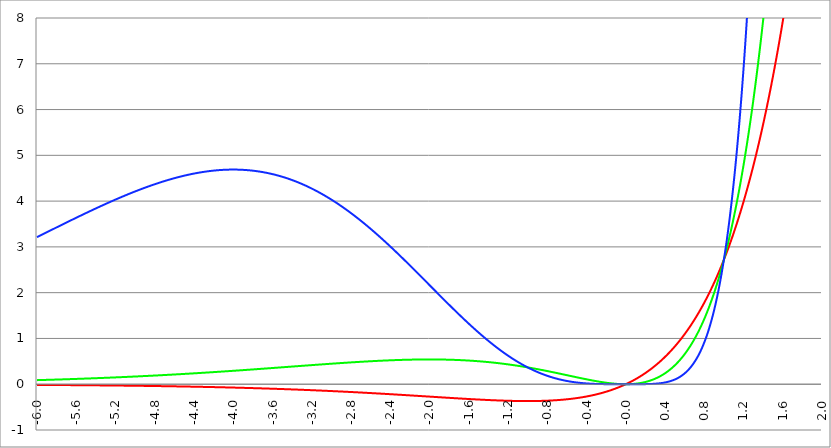
| Category | Series 1 | Series 0 | Series 2 |
|---|---|---|---|
| -6.0 | -0.015 | 0.089 | 3.212 |
| -5.996 | -0.015 | 0.089 | 3.217 |
| -5.992000000000001 | -0.015 | 0.09 | 3.221 |
| -5.988000000000001 | -0.015 | 0.09 | 3.225 |
| -5.984000000000002 | -0.015 | 0.09 | 3.23 |
| -5.980000000000002 | -0.015 | 0.09 | 3.234 |
| -5.976000000000002 | -0.015 | 0.091 | 3.238 |
| -5.972000000000003 | -0.015 | 0.091 | 3.242 |
| -5.968000000000003 | -0.015 | 0.091 | 3.247 |
| -5.964000000000004 | -0.015 | 0.091 | 3.251 |
| -5.960000000000004 | -0.015 | 0.092 | 3.255 |
| -5.956000000000004 | -0.015 | 0.092 | 3.26 |
| -5.952000000000005 | -0.015 | 0.092 | 3.264 |
| -5.948000000000005 | -0.016 | 0.092 | 3.268 |
| -5.944000000000006 | -0.016 | 0.093 | 3.272 |
| -5.940000000000006 | -0.016 | 0.093 | 3.277 |
| -5.936000000000007 | -0.016 | 0.093 | 3.281 |
| -5.932000000000007 | -0.016 | 0.093 | 3.285 |
| -5.928000000000008 | -0.016 | 0.094 | 3.29 |
| -5.924000000000008 | -0.016 | 0.094 | 3.294 |
| -5.920000000000009 | -0.016 | 0.094 | 3.298 |
| -5.91600000000001 | -0.016 | 0.094 | 3.302 |
| -5.91200000000001 | -0.016 | 0.095 | 3.307 |
| -5.90800000000001 | -0.016 | 0.095 | 3.311 |
| -5.904000000000011 | -0.016 | 0.095 | 3.315 |
| -5.900000000000011 | -0.016 | 0.095 | 3.319 |
| -5.896000000000011 | -0.016 | 0.096 | 3.324 |
| -5.892000000000012 | -0.016 | 0.096 | 3.328 |
| -5.888000000000012 | -0.016 | 0.096 | 3.332 |
| -5.884000000000013 | -0.016 | 0.096 | 3.337 |
| -5.880000000000013 | -0.016 | 0.097 | 3.341 |
| -5.876000000000014 | -0.016 | 0.097 | 3.345 |
| -5.872000000000014 | -0.017 | 0.097 | 3.349 |
| -5.868000000000014 | -0.017 | 0.097 | 3.354 |
| -5.864000000000015 | -0.017 | 0.098 | 3.358 |
| -5.860000000000015 | -0.017 | 0.098 | 3.362 |
| -5.856000000000016 | -0.017 | 0.098 | 3.366 |
| -5.852000000000016 | -0.017 | 0.098 | 3.371 |
| -5.848000000000017 | -0.017 | 0.099 | 3.375 |
| -5.844000000000017 | -0.017 | 0.099 | 3.379 |
| -5.840000000000018 | -0.017 | 0.099 | 3.384 |
| -5.836000000000018 | -0.017 | 0.099 | 3.388 |
| -5.832000000000018 | -0.017 | 0.1 | 3.392 |
| -5.828000000000019 | -0.017 | 0.1 | 3.396 |
| -5.824000000000019 | -0.017 | 0.1 | 3.401 |
| -5.82000000000002 | -0.017 | 0.101 | 3.405 |
| -5.81600000000002 | -0.017 | 0.101 | 3.409 |
| -5.812000000000021 | -0.017 | 0.101 | 3.413 |
| -5.808000000000021 | -0.017 | 0.101 | 3.418 |
| -5.804000000000022 | -0.018 | 0.102 | 3.422 |
| -5.800000000000022 | -0.018 | 0.102 | 3.426 |
| -5.796000000000022 | -0.018 | 0.102 | 3.43 |
| -5.792000000000023 | -0.018 | 0.102 | 3.435 |
| -5.788000000000023 | -0.018 | 0.103 | 3.439 |
| -5.784000000000024 | -0.018 | 0.103 | 3.443 |
| -5.780000000000024 | -0.018 | 0.103 | 3.447 |
| -5.776000000000024 | -0.018 | 0.103 | 3.452 |
| -5.772000000000025 | -0.018 | 0.104 | 3.456 |
| -5.768000000000025 | -0.018 | 0.104 | 3.46 |
| -5.764000000000026 | -0.018 | 0.104 | 3.464 |
| -5.760000000000026 | -0.018 | 0.105 | 3.469 |
| -5.756000000000026 | -0.018 | 0.105 | 3.473 |
| -5.752000000000027 | -0.018 | 0.105 | 3.477 |
| -5.748000000000027 | -0.018 | 0.105 | 3.481 |
| -5.744000000000028 | -0.018 | 0.106 | 3.486 |
| -5.740000000000028 | -0.018 | 0.106 | 3.49 |
| -5.73600000000003 | -0.019 | 0.106 | 3.494 |
| -5.73200000000003 | -0.019 | 0.106 | 3.498 |
| -5.72800000000003 | -0.019 | 0.107 | 3.502 |
| -5.72400000000003 | -0.019 | 0.107 | 3.507 |
| -5.720000000000031 | -0.019 | 0.107 | 3.511 |
| -5.716000000000031 | -0.019 | 0.108 | 3.515 |
| -5.712000000000032 | -0.019 | 0.108 | 3.519 |
| -5.708000000000032 | -0.019 | 0.108 | 3.524 |
| -5.704000000000033 | -0.019 | 0.108 | 3.528 |
| -5.700000000000033 | -0.019 | 0.109 | 3.532 |
| -5.696000000000033 | -0.019 | 0.109 | 3.536 |
| -5.692000000000034 | -0.019 | 0.109 | 3.54 |
| -5.688000000000034 | -0.019 | 0.11 | 3.545 |
| -5.684000000000035 | -0.019 | 0.11 | 3.549 |
| -5.680000000000035 | -0.019 | 0.11 | 3.553 |
| -5.676000000000035 | -0.019 | 0.11 | 3.557 |
| -5.672000000000036 | -0.02 | 0.111 | 3.561 |
| -5.668000000000036 | -0.02 | 0.111 | 3.566 |
| -5.664000000000037 | -0.02 | 0.111 | 3.57 |
| -5.660000000000037 | -0.02 | 0.112 | 3.574 |
| -5.656000000000038 | -0.02 | 0.112 | 3.578 |
| -5.652000000000038 | -0.02 | 0.112 | 3.582 |
| -5.648000000000039 | -0.02 | 0.112 | 3.587 |
| -5.644000000000039 | -0.02 | 0.113 | 3.591 |
| -5.64000000000004 | -0.02 | 0.113 | 3.595 |
| -5.63600000000004 | -0.02 | 0.113 | 3.599 |
| -5.63200000000004 | -0.02 | 0.114 | 3.603 |
| -5.628000000000041 | -0.02 | 0.114 | 3.608 |
| -5.624000000000041 | -0.02 | 0.114 | 3.612 |
| -5.620000000000042 | -0.02 | 0.114 | 3.616 |
| -5.616000000000042 | -0.02 | 0.115 | 3.62 |
| -5.612000000000043 | -0.021 | 0.115 | 3.624 |
| -5.608000000000043 | -0.021 | 0.115 | 3.628 |
| -5.604000000000044 | -0.021 | 0.116 | 3.633 |
| -5.600000000000044 | -0.021 | 0.116 | 3.637 |
| -5.596000000000044 | -0.021 | 0.116 | 3.641 |
| -5.592000000000045 | -0.021 | 0.117 | 3.645 |
| -5.588000000000045 | -0.021 | 0.117 | 3.649 |
| -5.584000000000046 | -0.021 | 0.117 | 3.653 |
| -5.580000000000046 | -0.021 | 0.117 | 3.657 |
| -5.576000000000046 | -0.021 | 0.118 | 3.662 |
| -5.572000000000047 | -0.021 | 0.118 | 3.666 |
| -5.568000000000048 | -0.021 | 0.118 | 3.67 |
| -5.564000000000048 | -0.021 | 0.119 | 3.674 |
| -5.560000000000048 | -0.021 | 0.119 | 3.678 |
| -5.556000000000049 | -0.021 | 0.119 | 3.682 |
| -5.552000000000049 | -0.022 | 0.12 | 3.686 |
| -5.54800000000005 | -0.022 | 0.12 | 3.69 |
| -5.54400000000005 | -0.022 | 0.12 | 3.695 |
| -5.540000000000051 | -0.022 | 0.121 | 3.699 |
| -5.536000000000051 | -0.022 | 0.121 | 3.703 |
| -5.532000000000052 | -0.022 | 0.121 | 3.707 |
| -5.528000000000052 | -0.022 | 0.121 | 3.711 |
| -5.524000000000052 | -0.022 | 0.122 | 3.715 |
| -5.520000000000053 | -0.022 | 0.122 | 3.719 |
| -5.516000000000053 | -0.022 | 0.122 | 3.723 |
| -5.512000000000054 | -0.022 | 0.123 | 3.727 |
| -5.508000000000054 | -0.022 | 0.123 | 3.731 |
| -5.504000000000055 | -0.022 | 0.123 | 3.736 |
| -5.500000000000055 | -0.022 | 0.124 | 3.74 |
| -5.496000000000055 | -0.023 | 0.124 | 3.744 |
| -5.492000000000056 | -0.023 | 0.124 | 3.748 |
| -5.488000000000056 | -0.023 | 0.125 | 3.752 |
| -5.484000000000057 | -0.023 | 0.125 | 3.756 |
| -5.480000000000057 | -0.023 | 0.125 | 3.76 |
| -5.476000000000057 | -0.023 | 0.126 | 3.764 |
| -5.472000000000058 | -0.023 | 0.126 | 3.768 |
| -5.468000000000059 | -0.023 | 0.126 | 3.772 |
| -5.464000000000059 | -0.023 | 0.126 | 3.776 |
| -5.460000000000059 | -0.023 | 0.127 | 3.78 |
| -5.45600000000006 | -0.023 | 0.127 | 3.784 |
| -5.45200000000006 | -0.023 | 0.127 | 3.788 |
| -5.44800000000006 | -0.023 | 0.128 | 3.792 |
| -5.444000000000061 | -0.024 | 0.128 | 3.796 |
| -5.440000000000061 | -0.024 | 0.128 | 3.8 |
| -5.436000000000062 | -0.024 | 0.129 | 3.804 |
| -5.432000000000062 | -0.024 | 0.129 | 3.808 |
| -5.428000000000063 | -0.024 | 0.129 | 3.812 |
| -5.424000000000063 | -0.024 | 0.13 | 3.817 |
| -5.420000000000064 | -0.024 | 0.13 | 3.821 |
| -5.416000000000064 | -0.024 | 0.13 | 3.825 |
| -5.412000000000064 | -0.024 | 0.131 | 3.829 |
| -5.408000000000065 | -0.024 | 0.131 | 3.833 |
| -5.404000000000065 | -0.024 | 0.131 | 3.836 |
| -5.400000000000066 | -0.024 | 0.132 | 3.84 |
| -5.396000000000066 | -0.024 | 0.132 | 3.844 |
| -5.392000000000067 | -0.025 | 0.132 | 3.848 |
| -5.388000000000067 | -0.025 | 0.133 | 3.852 |
| -5.384000000000068 | -0.025 | 0.133 | 3.856 |
| -5.380000000000068 | -0.025 | 0.133 | 3.86 |
| -5.376000000000068 | -0.025 | 0.134 | 3.864 |
| -5.37200000000007 | -0.025 | 0.134 | 3.868 |
| -5.36800000000007 | -0.025 | 0.134 | 3.872 |
| -5.36400000000007 | -0.025 | 0.135 | 3.876 |
| -5.36000000000007 | -0.025 | 0.135 | 3.88 |
| -5.356000000000071 | -0.025 | 0.135 | 3.884 |
| -5.352000000000071 | -0.025 | 0.136 | 3.888 |
| -5.348000000000072 | -0.025 | 0.136 | 3.892 |
| -5.344000000000072 | -0.026 | 0.136 | 3.896 |
| -5.340000000000073 | -0.026 | 0.137 | 3.9 |
| -5.336000000000073 | -0.026 | 0.137 | 3.904 |
| -5.332000000000074 | -0.026 | 0.137 | 3.908 |
| -5.328000000000074 | -0.026 | 0.138 | 3.911 |
| -5.324000000000074 | -0.026 | 0.138 | 3.915 |
| -5.320000000000075 | -0.026 | 0.138 | 3.919 |
| -5.316000000000075 | -0.026 | 0.139 | 3.923 |
| -5.312000000000076 | -0.026 | 0.139 | 3.927 |
| -5.308000000000076 | -0.026 | 0.14 | 3.931 |
| -5.304000000000077 | -0.026 | 0.14 | 3.935 |
| -5.300000000000077 | -0.026 | 0.14 | 3.939 |
| -5.296000000000077 | -0.027 | 0.141 | 3.942 |
| -5.292000000000078 | -0.027 | 0.141 | 3.946 |
| -5.288000000000078 | -0.027 | 0.141 | 3.95 |
| -5.284000000000079 | -0.027 | 0.142 | 3.954 |
| -5.28000000000008 | -0.027 | 0.142 | 3.958 |
| -5.27600000000008 | -0.027 | 0.142 | 3.962 |
| -5.27200000000008 | -0.027 | 0.143 | 3.966 |
| -5.268000000000081 | -0.027 | 0.143 | 3.969 |
| -5.264000000000081 | -0.027 | 0.143 | 3.973 |
| -5.260000000000081 | -0.027 | 0.144 | 3.977 |
| -5.256000000000082 | -0.027 | 0.144 | 3.981 |
| -5.252000000000082 | -0.028 | 0.144 | 3.985 |
| -5.248000000000083 | -0.028 | 0.145 | 3.988 |
| -5.244000000000083 | -0.028 | 0.145 | 3.992 |
| -5.240000000000084 | -0.028 | 0.146 | 3.996 |
| -5.236000000000084 | -0.028 | 0.146 | 4 |
| -5.232000000000084 | -0.028 | 0.146 | 4.004 |
| -5.228000000000085 | -0.028 | 0.147 | 4.007 |
| -5.224000000000085 | -0.028 | 0.147 | 4.011 |
| -5.220000000000086 | -0.028 | 0.147 | 4.015 |
| -5.216000000000086 | -0.028 | 0.148 | 4.019 |
| -5.212000000000087 | -0.028 | 0.148 | 4.022 |
| -5.208000000000087 | -0.029 | 0.148 | 4.026 |
| -5.204000000000088 | -0.029 | 0.149 | 4.03 |
| -5.200000000000088 | -0.029 | 0.149 | 4.034 |
| -5.196000000000089 | -0.029 | 0.15 | 4.037 |
| -5.192000000000089 | -0.029 | 0.15 | 4.041 |
| -5.188000000000089 | -0.029 | 0.15 | 4.045 |
| -5.18400000000009 | -0.029 | 0.151 | 4.048 |
| -5.18000000000009 | -0.029 | 0.151 | 4.052 |
| -5.176000000000091 | -0.029 | 0.151 | 4.056 |
| -5.172000000000091 | -0.029 | 0.152 | 4.059 |
| -5.168000000000092 | -0.029 | 0.152 | 4.063 |
| -5.164000000000092 | -0.03 | 0.153 | 4.067 |
| -5.160000000000092 | -0.03 | 0.153 | 4.07 |
| -5.156000000000093 | -0.03 | 0.153 | 4.074 |
| -5.152000000000093 | -0.03 | 0.154 | 4.078 |
| -5.148000000000094 | -0.03 | 0.154 | 4.081 |
| -5.144000000000094 | -0.03 | 0.154 | 4.085 |
| -5.140000000000095 | -0.03 | 0.155 | 4.089 |
| -5.136000000000095 | -0.03 | 0.155 | 4.092 |
| -5.132000000000096 | -0.03 | 0.156 | 4.096 |
| -5.128000000000096 | -0.03 | 0.156 | 4.099 |
| -5.124000000000096 | -0.03 | 0.156 | 4.103 |
| -5.120000000000097 | -0.031 | 0.157 | 4.107 |
| -5.116000000000097 | -0.031 | 0.157 | 4.11 |
| -5.112000000000098 | -0.031 | 0.157 | 4.114 |
| -5.108000000000098 | -0.031 | 0.158 | 4.117 |
| -5.104000000000099 | -0.031 | 0.158 | 4.121 |
| -5.100000000000099 | -0.031 | 0.159 | 4.125 |
| -5.0960000000001 | -0.031 | 0.159 | 4.128 |
| -5.0920000000001 | -0.031 | 0.159 | 4.132 |
| -5.0880000000001 | -0.031 | 0.16 | 4.135 |
| -5.084000000000101 | -0.031 | 0.16 | 4.139 |
| -5.080000000000101 | -0.032 | 0.161 | 4.142 |
| -5.076000000000101 | -0.032 | 0.161 | 4.146 |
| -5.072000000000102 | -0.032 | 0.161 | 4.149 |
| -5.068000000000103 | -0.032 | 0.162 | 4.153 |
| -5.064000000000103 | -0.032 | 0.162 | 4.156 |
| -5.060000000000104 | -0.032 | 0.162 | 4.16 |
| -5.056000000000104 | -0.032 | 0.163 | 4.163 |
| -5.052000000000104 | -0.032 | 0.163 | 4.167 |
| -5.048000000000104 | -0.032 | 0.164 | 4.17 |
| -5.044000000000105 | -0.033 | 0.164 | 4.174 |
| -5.040000000000105 | -0.033 | 0.164 | 4.177 |
| -5.036000000000106 | -0.033 | 0.165 | 4.181 |
| -5.032000000000106 | -0.033 | 0.165 | 4.184 |
| -5.028000000000107 | -0.033 | 0.166 | 4.187 |
| -5.024000000000107 | -0.033 | 0.166 | 4.191 |
| -5.020000000000108 | -0.033 | 0.166 | 4.194 |
| -5.016000000000108 | -0.033 | 0.167 | 4.198 |
| -5.012000000000109 | -0.033 | 0.167 | 4.201 |
| -5.00800000000011 | -0.033 | 0.168 | 4.204 |
| -5.00400000000011 | -0.034 | 0.168 | 4.208 |
| -5.00000000000011 | -0.034 | 0.168 | 4.211 |
| -4.99600000000011 | -0.034 | 0.169 | 4.215 |
| -4.992000000000111 | -0.034 | 0.169 | 4.218 |
| -4.988000000000111 | -0.034 | 0.17 | 4.221 |
| -4.984000000000112 | -0.034 | 0.17 | 4.225 |
| -4.980000000000112 | -0.034 | 0.17 | 4.228 |
| -4.976000000000112 | -0.034 | 0.171 | 4.231 |
| -4.972000000000113 | -0.034 | 0.171 | 4.235 |
| -4.968000000000114 | -0.035 | 0.172 | 4.238 |
| -4.964000000000114 | -0.035 | 0.172 | 4.241 |
| -4.960000000000114 | -0.035 | 0.173 | 4.244 |
| -4.956000000000114 | -0.035 | 0.173 | 4.248 |
| -4.952000000000115 | -0.035 | 0.173 | 4.251 |
| -4.948000000000115 | -0.035 | 0.174 | 4.254 |
| -4.944000000000116 | -0.035 | 0.174 | 4.258 |
| -4.940000000000116 | -0.035 | 0.175 | 4.261 |
| -4.936000000000117 | -0.035 | 0.175 | 4.264 |
| -4.932000000000117 | -0.036 | 0.175 | 4.267 |
| -4.928000000000118 | -0.036 | 0.176 | 4.271 |
| -4.924000000000118 | -0.036 | 0.176 | 4.274 |
| -4.920000000000119 | -0.036 | 0.177 | 4.277 |
| -4.91600000000012 | -0.036 | 0.177 | 4.28 |
| -4.91200000000012 | -0.036 | 0.178 | 4.283 |
| -4.90800000000012 | -0.036 | 0.178 | 4.286 |
| -4.90400000000012 | -0.036 | 0.178 | 4.29 |
| -4.90000000000012 | -0.036 | 0.179 | 4.293 |
| -4.896000000000121 | -0.037 | 0.179 | 4.296 |
| -4.892000000000122 | -0.037 | 0.18 | 4.299 |
| -4.888000000000122 | -0.037 | 0.18 | 4.302 |
| -4.884000000000123 | -0.037 | 0.18 | 4.305 |
| -4.880000000000123 | -0.037 | 0.181 | 4.308 |
| -4.876000000000123 | -0.037 | 0.181 | 4.312 |
| -4.872000000000124 | -0.037 | 0.182 | 4.315 |
| -4.868000000000124 | -0.037 | 0.182 | 4.318 |
| -4.864000000000125 | -0.038 | 0.183 | 4.321 |
| -4.860000000000125 | -0.038 | 0.183 | 4.324 |
| -4.856000000000125 | -0.038 | 0.183 | 4.327 |
| -4.852000000000126 | -0.038 | 0.184 | 4.33 |
| -4.848000000000126 | -0.038 | 0.184 | 4.333 |
| -4.844000000000127 | -0.038 | 0.185 | 4.336 |
| -4.840000000000127 | -0.038 | 0.185 | 4.339 |
| -4.836000000000128 | -0.038 | 0.186 | 4.342 |
| -4.832000000000128 | -0.039 | 0.186 | 4.345 |
| -4.82800000000013 | -0.039 | 0.187 | 4.348 |
| -4.824000000000129 | -0.039 | 0.187 | 4.351 |
| -4.82000000000013 | -0.039 | 0.187 | 4.354 |
| -4.81600000000013 | -0.039 | 0.188 | 4.357 |
| -4.812000000000131 | -0.039 | 0.188 | 4.36 |
| -4.808000000000131 | -0.039 | 0.189 | 4.363 |
| -4.804000000000132 | -0.039 | 0.189 | 4.366 |
| -4.800000000000132 | -0.04 | 0.19 | 4.369 |
| -4.796000000000132 | -0.04 | 0.19 | 4.372 |
| -4.792000000000133 | -0.04 | 0.19 | 4.374 |
| -4.788000000000133 | -0.04 | 0.191 | 4.377 |
| -4.784000000000134 | -0.04 | 0.191 | 4.38 |
| -4.780000000000134 | -0.04 | 0.192 | 4.383 |
| -4.776000000000134 | -0.04 | 0.192 | 4.386 |
| -4.772000000000135 | -0.04 | 0.193 | 4.389 |
| -4.768000000000135 | -0.041 | 0.193 | 4.392 |
| -4.764000000000136 | -0.041 | 0.194 | 4.394 |
| -4.760000000000136 | -0.041 | 0.194 | 4.397 |
| -4.756000000000136 | -0.041 | 0.195 | 4.4 |
| -4.752000000000137 | -0.041 | 0.195 | 4.403 |
| -4.748000000000137 | -0.041 | 0.195 | 4.406 |
| -4.744000000000138 | -0.041 | 0.196 | 4.408 |
| -4.740000000000138 | -0.041 | 0.196 | 4.411 |
| -4.73600000000014 | -0.042 | 0.197 | 4.414 |
| -4.73200000000014 | -0.042 | 0.197 | 4.417 |
| -4.72800000000014 | -0.042 | 0.198 | 4.419 |
| -4.72400000000014 | -0.042 | 0.198 | 4.422 |
| -4.720000000000141 | -0.042 | 0.199 | 4.425 |
| -4.716000000000141 | -0.042 | 0.199 | 4.428 |
| -4.712000000000142 | -0.042 | 0.2 | 4.43 |
| -4.708000000000142 | -0.042 | 0.2 | 4.433 |
| -4.704000000000143 | -0.043 | 0.2 | 4.436 |
| -4.700000000000143 | -0.043 | 0.201 | 4.438 |
| -4.696000000000143 | -0.043 | 0.201 | 4.441 |
| -4.692000000000144 | -0.043 | 0.202 | 4.443 |
| -4.688000000000144 | -0.043 | 0.202 | 4.446 |
| -4.684000000000145 | -0.043 | 0.203 | 4.449 |
| -4.680000000000145 | -0.043 | 0.203 | 4.451 |
| -4.676000000000145 | -0.044 | 0.204 | 4.454 |
| -4.672000000000146 | -0.044 | 0.204 | 4.456 |
| -4.668000000000147 | -0.044 | 0.205 | 4.459 |
| -4.664000000000147 | -0.044 | 0.205 | 4.462 |
| -4.660000000000147 | -0.044 | 0.206 | 4.464 |
| -4.656000000000148 | -0.044 | 0.206 | 4.467 |
| -4.652000000000148 | -0.044 | 0.207 | 4.469 |
| -4.648000000000149 | -0.045 | 0.207 | 4.472 |
| -4.644000000000149 | -0.045 | 0.207 | 4.474 |
| -4.64000000000015 | -0.045 | 0.208 | 4.477 |
| -4.63600000000015 | -0.045 | 0.208 | 4.479 |
| -4.632000000000151 | -0.045 | 0.209 | 4.481 |
| -4.628000000000151 | -0.045 | 0.209 | 4.484 |
| -4.624000000000151 | -0.045 | 0.21 | 4.486 |
| -4.620000000000152 | -0.046 | 0.21 | 4.489 |
| -4.616000000000152 | -0.046 | 0.211 | 4.491 |
| -4.612000000000153 | -0.046 | 0.211 | 4.494 |
| -4.608000000000153 | -0.046 | 0.212 | 4.496 |
| -4.604000000000154 | -0.046 | 0.212 | 4.498 |
| -4.600000000000154 | -0.046 | 0.213 | 4.501 |
| -4.596000000000154 | -0.046 | 0.213 | 4.503 |
| -4.592000000000155 | -0.047 | 0.214 | 4.505 |
| -4.588000000000155 | -0.047 | 0.214 | 4.508 |
| -4.584000000000156 | -0.047 | 0.215 | 4.51 |
| -4.580000000000156 | -0.047 | 0.215 | 4.512 |
| -4.576000000000156 | -0.047 | 0.216 | 4.515 |
| -4.572000000000157 | -0.047 | 0.216 | 4.517 |
| -4.568000000000158 | -0.047 | 0.217 | 4.519 |
| -4.564000000000158 | -0.048 | 0.217 | 4.521 |
| -4.560000000000159 | -0.048 | 0.218 | 4.524 |
| -4.55600000000016 | -0.048 | 0.218 | 4.526 |
| -4.552000000000159 | -0.048 | 0.219 | 4.528 |
| -4.54800000000016 | -0.048 | 0.219 | 4.53 |
| -4.54400000000016 | -0.048 | 0.22 | 4.532 |
| -4.54000000000016 | -0.048 | 0.22 | 4.534 |
| -4.53600000000016 | -0.049 | 0.22 | 4.537 |
| -4.532000000000161 | -0.049 | 0.221 | 4.539 |
| -4.528000000000162 | -0.049 | 0.221 | 4.541 |
| -4.524000000000163 | -0.049 | 0.222 | 4.543 |
| -4.520000000000163 | -0.049 | 0.222 | 4.545 |
| -4.516000000000163 | -0.049 | 0.223 | 4.547 |
| -4.512000000000164 | -0.05 | 0.223 | 4.549 |
| -4.508000000000164 | -0.05 | 0.224 | 4.551 |
| -4.504000000000164 | -0.05 | 0.224 | 4.553 |
| -4.500000000000165 | -0.05 | 0.225 | 4.555 |
| -4.496000000000165 | -0.05 | 0.225 | 4.557 |
| -4.492000000000166 | -0.05 | 0.226 | 4.559 |
| -4.488000000000166 | -0.05 | 0.226 | 4.561 |
| -4.484000000000166 | -0.051 | 0.227 | 4.563 |
| -4.480000000000167 | -0.051 | 0.227 | 4.565 |
| -4.476000000000167 | -0.051 | 0.228 | 4.567 |
| -4.472000000000168 | -0.051 | 0.228 | 4.569 |
| -4.468000000000168 | -0.051 | 0.229 | 4.571 |
| -4.46400000000017 | -0.051 | 0.229 | 4.573 |
| -4.46000000000017 | -0.052 | 0.23 | 4.575 |
| -4.45600000000017 | -0.052 | 0.231 | 4.577 |
| -4.45200000000017 | -0.052 | 0.231 | 4.579 |
| -4.44800000000017 | -0.052 | 0.232 | 4.581 |
| -4.444000000000171 | -0.052 | 0.232 | 4.582 |
| -4.440000000000171 | -0.052 | 0.233 | 4.584 |
| -4.436000000000172 | -0.053 | 0.233 | 4.586 |
| -4.432000000000172 | -0.053 | 0.234 | 4.588 |
| -4.428000000000173 | -0.053 | 0.234 | 4.59 |
| -4.424000000000174 | -0.053 | 0.235 | 4.591 |
| -4.420000000000174 | -0.053 | 0.235 | 4.593 |
| -4.416000000000174 | -0.053 | 0.236 | 4.595 |
| -4.412000000000174 | -0.054 | 0.236 | 4.597 |
| -4.408000000000175 | -0.054 | 0.237 | 4.598 |
| -4.404000000000175 | -0.054 | 0.237 | 4.6 |
| -4.400000000000176 | -0.054 | 0.238 | 4.602 |
| -4.396000000000176 | -0.054 | 0.238 | 4.603 |
| -4.392000000000177 | -0.054 | 0.239 | 4.605 |
| -4.388000000000177 | -0.055 | 0.239 | 4.607 |
| -4.384000000000178 | -0.055 | 0.24 | 4.608 |
| -4.380000000000178 | -0.055 | 0.24 | 4.61 |
| -4.376000000000178 | -0.055 | 0.241 | 4.611 |
| -4.37200000000018 | -0.055 | 0.241 | 4.613 |
| -4.36800000000018 | -0.055 | 0.242 | 4.615 |
| -4.36400000000018 | -0.056 | 0.242 | 4.616 |
| -4.360000000000181 | -0.056 | 0.243 | 4.618 |
| -4.356000000000181 | -0.056 | 0.243 | 4.619 |
| -4.352000000000181 | -0.056 | 0.244 | 4.621 |
| -4.348000000000182 | -0.056 | 0.244 | 4.622 |
| -4.344000000000182 | -0.056 | 0.245 | 4.624 |
| -4.340000000000183 | -0.057 | 0.246 | 4.625 |
| -4.336000000000183 | -0.057 | 0.246 | 4.627 |
| -4.332000000000184 | -0.057 | 0.247 | 4.628 |
| -4.328000000000184 | -0.057 | 0.247 | 4.629 |
| -4.324000000000185 | -0.057 | 0.248 | 4.631 |
| -4.320000000000185 | -0.057 | 0.248 | 4.632 |
| -4.316000000000185 | -0.058 | 0.249 | 4.634 |
| -4.312000000000186 | -0.058 | 0.249 | 4.635 |
| -4.308000000000186 | -0.058 | 0.25 | 4.636 |
| -4.304000000000187 | -0.058 | 0.25 | 4.638 |
| -4.300000000000187 | -0.058 | 0.251 | 4.639 |
| -4.296000000000187 | -0.059 | 0.251 | 4.64 |
| -4.292000000000188 | -0.059 | 0.252 | 4.641 |
| -4.288000000000188 | -0.059 | 0.252 | 4.643 |
| -4.284000000000189 | -0.059 | 0.253 | 4.644 |
| -4.28000000000019 | -0.059 | 0.254 | 4.645 |
| -4.27600000000019 | -0.059 | 0.254 | 4.646 |
| -4.27200000000019 | -0.06 | 0.255 | 4.647 |
| -4.268000000000191 | -0.06 | 0.255 | 4.649 |
| -4.264000000000191 | -0.06 | 0.256 | 4.65 |
| -4.260000000000192 | -0.06 | 0.256 | 4.651 |
| -4.256000000000192 | -0.06 | 0.257 | 4.652 |
| -4.252000000000192 | -0.061 | 0.257 | 4.653 |
| -4.248000000000193 | -0.061 | 0.258 | 4.654 |
| -4.244000000000193 | -0.061 | 0.258 | 4.655 |
| -4.240000000000194 | -0.061 | 0.259 | 4.656 |
| -4.236000000000194 | -0.061 | 0.26 | 4.657 |
| -4.232000000000194 | -0.061 | 0.26 | 4.659 |
| -4.228000000000195 | -0.062 | 0.261 | 4.66 |
| -4.224000000000196 | -0.062 | 0.261 | 4.661 |
| -4.220000000000196 | -0.062 | 0.262 | 4.662 |
| -4.216000000000196 | -0.062 | 0.262 | 4.662 |
| -4.212000000000197 | -0.062 | 0.263 | 4.663 |
| -4.208000000000197 | -0.063 | 0.263 | 4.664 |
| -4.204000000000198 | -0.063 | 0.264 | 4.665 |
| -4.200000000000198 | -0.063 | 0.265 | 4.666 |
| -4.196000000000199 | -0.063 | 0.265 | 4.667 |
| -4.192000000000199 | -0.063 | 0.266 | 4.668 |
| -4.1880000000002 | -0.064 | 0.266 | 4.669 |
| -4.1840000000002 | -0.064 | 0.267 | 4.67 |
| -4.1800000000002 | -0.064 | 0.267 | 4.67 |
| -4.176000000000201 | -0.064 | 0.268 | 4.671 |
| -4.172000000000201 | -0.064 | 0.268 | 4.672 |
| -4.168000000000202 | -0.065 | 0.269 | 4.673 |
| -4.164000000000202 | -0.065 | 0.27 | 4.673 |
| -4.160000000000203 | -0.065 | 0.27 | 4.674 |
| -4.156000000000203 | -0.065 | 0.271 | 4.675 |
| -4.152000000000204 | -0.065 | 0.271 | 4.676 |
| -4.148000000000204 | -0.066 | 0.272 | 4.676 |
| -4.144000000000204 | -0.066 | 0.272 | 4.677 |
| -4.140000000000205 | -0.066 | 0.273 | 4.678 |
| -4.136000000000205 | -0.066 | 0.273 | 4.678 |
| -4.132000000000206 | -0.066 | 0.274 | 4.679 |
| -4.128000000000206 | -0.067 | 0.275 | 4.679 |
| -4.124000000000207 | -0.067 | 0.275 | 4.68 |
| -4.120000000000207 | -0.067 | 0.276 | 4.681 |
| -4.116000000000207 | -0.067 | 0.276 | 4.681 |
| -4.112000000000208 | -0.067 | 0.277 | 4.682 |
| -4.108000000000208 | -0.068 | 0.277 | 4.682 |
| -4.104000000000209 | -0.068 | 0.278 | 4.683 |
| -4.100000000000209 | -0.068 | 0.279 | 4.683 |
| -4.09600000000021 | -0.068 | 0.279 | 4.683 |
| -4.09200000000021 | -0.068 | 0.28 | 4.684 |
| -4.088000000000211 | -0.069 | 0.28 | 4.684 |
| -4.084000000000211 | -0.069 | 0.281 | 4.685 |
| -4.080000000000211 | -0.069 | 0.281 | 4.685 |
| -4.076000000000212 | -0.069 | 0.282 | 4.685 |
| -4.072000000000212 | -0.069 | 0.283 | 4.686 |
| -4.068000000000213 | -0.07 | 0.283 | 4.686 |
| -4.064000000000213 | -0.07 | 0.284 | 4.686 |
| -4.060000000000214 | -0.07 | 0.284 | 4.687 |
| -4.056000000000214 | -0.07 | 0.285 | 4.687 |
| -4.052000000000215 | -0.07 | 0.285 | 4.687 |
| -4.048000000000215 | -0.071 | 0.286 | 4.687 |
| -4.044000000000215 | -0.071 | 0.287 | 4.688 |
| -4.040000000000216 | -0.071 | 0.287 | 4.688 |
| -4.036000000000216 | -0.071 | 0.288 | 4.688 |
| -4.032000000000217 | -0.072 | 0.288 | 4.688 |
| -4.028000000000217 | -0.072 | 0.289 | 4.688 |
| -4.024000000000218 | -0.072 | 0.29 | 4.688 |
| -4.020000000000218 | -0.072 | 0.29 | 4.689 |
| -4.016000000000219 | -0.072 | 0.291 | 4.689 |
| -4.012000000000219 | -0.073 | 0.291 | 4.689 |
| -4.008000000000219 | -0.073 | 0.292 | 4.689 |
| -4.00400000000022 | -0.073 | 0.292 | 4.689 |
| -4.00000000000022 | -0.073 | 0.293 | 4.689 |
| -3.99600000000022 | -0.073 | 0.294 | 4.689 |
| -3.99200000000022 | -0.074 | 0.294 | 4.689 |
| -3.98800000000022 | -0.074 | 0.295 | 4.689 |
| -3.98400000000022 | -0.074 | 0.295 | 4.689 |
| -3.98000000000022 | -0.074 | 0.296 | 4.689 |
| -3.97600000000022 | -0.075 | 0.297 | 4.688 |
| -3.97200000000022 | -0.075 | 0.297 | 4.688 |
| -3.96800000000022 | -0.075 | 0.298 | 4.688 |
| -3.96400000000022 | -0.075 | 0.298 | 4.688 |
| -3.96000000000022 | -0.075 | 0.299 | 4.688 |
| -3.95600000000022 | -0.076 | 0.3 | 4.688 |
| -3.95200000000022 | -0.076 | 0.3 | 4.687 |
| -3.94800000000022 | -0.076 | 0.301 | 4.687 |
| -3.94400000000022 | -0.076 | 0.301 | 4.687 |
| -3.94000000000022 | -0.077 | 0.302 | 4.687 |
| -3.93600000000022 | -0.077 | 0.303 | 4.686 |
| -3.93200000000022 | -0.077 | 0.303 | 4.686 |
| -3.92800000000022 | -0.077 | 0.304 | 4.686 |
| -3.92400000000022 | -0.078 | 0.304 | 4.685 |
| -3.92000000000022 | -0.078 | 0.305 | 4.685 |
| -3.91600000000022 | -0.078 | 0.305 | 4.685 |
| -3.91200000000022 | -0.078 | 0.306 | 4.684 |
| -3.90800000000022 | -0.078 | 0.307 | 4.684 |
| -3.90400000000022 | -0.079 | 0.307 | 4.683 |
| -3.90000000000022 | -0.079 | 0.308 | 4.683 |
| -3.89600000000022 | -0.079 | 0.308 | 4.682 |
| -3.89200000000022 | -0.079 | 0.309 | 4.682 |
| -3.88800000000022 | -0.08 | 0.31 | 4.681 |
| -3.88400000000022 | -0.08 | 0.31 | 4.681 |
| -3.88000000000022 | -0.08 | 0.311 | 4.68 |
| -3.87600000000022 | -0.08 | 0.311 | 4.68 |
| -3.87200000000022 | -0.081 | 0.312 | 4.679 |
| -3.86800000000022 | -0.081 | 0.313 | 4.678 |
| -3.86400000000022 | -0.081 | 0.313 | 4.678 |
| -3.86000000000022 | -0.081 | 0.314 | 4.677 |
| -3.85600000000022 | -0.082 | 0.315 | 4.676 |
| -3.85200000000022 | -0.082 | 0.315 | 4.676 |
| -3.84800000000022 | -0.082 | 0.316 | 4.675 |
| -3.84400000000022 | -0.082 | 0.316 | 4.674 |
| -3.84000000000022 | -0.083 | 0.317 | 4.673 |
| -3.83600000000022 | -0.083 | 0.318 | 4.673 |
| -3.83200000000022 | -0.083 | 0.318 | 4.672 |
| -3.82800000000022 | -0.083 | 0.319 | 4.671 |
| -3.82400000000022 | -0.084 | 0.319 | 4.67 |
| -3.82000000000022 | -0.084 | 0.32 | 4.669 |
| -3.81600000000022 | -0.084 | 0.321 | 4.668 |
| -3.81200000000022 | -0.084 | 0.321 | 4.667 |
| -3.80800000000022 | -0.085 | 0.322 | 4.667 |
| -3.80400000000022 | -0.085 | 0.322 | 4.666 |
| -3.80000000000022 | -0.085 | 0.323 | 4.665 |
| -3.79600000000022 | -0.085 | 0.324 | 4.664 |
| -3.79200000000022 | -0.086 | 0.324 | 4.663 |
| -3.78800000000022 | -0.086 | 0.325 | 4.662 |
| -3.78400000000022 | -0.086 | 0.325 | 4.661 |
| -3.78000000000022 | -0.086 | 0.326 | 4.659 |
| -3.77600000000022 | -0.087 | 0.327 | 4.658 |
| -3.77200000000022 | -0.087 | 0.327 | 4.657 |
| -3.76800000000022 | -0.087 | 0.328 | 4.656 |
| -3.76400000000022 | -0.087 | 0.329 | 4.655 |
| -3.76000000000022 | -0.088 | 0.329 | 4.654 |
| -3.75600000000022 | -0.088 | 0.33 | 4.653 |
| -3.75200000000022 | -0.088 | 0.33 | 4.651 |
| -3.74800000000022 | -0.088 | 0.331 | 4.65 |
| -3.74400000000022 | -0.089 | 0.332 | 4.649 |
| -3.74000000000022 | -0.089 | 0.332 | 4.648 |
| -3.73600000000022 | -0.089 | 0.333 | 4.646 |
| -3.73200000000022 | -0.089 | 0.334 | 4.645 |
| -3.72800000000022 | -0.09 | 0.334 | 4.644 |
| -3.72400000000022 | -0.09 | 0.335 | 4.642 |
| -3.72000000000022 | -0.09 | 0.335 | 4.641 |
| -3.71600000000022 | -0.09 | 0.336 | 4.639 |
| -3.71200000000022 | -0.091 | 0.337 | 4.638 |
| -3.70800000000022 | -0.091 | 0.337 | 4.637 |
| -3.70400000000022 | -0.091 | 0.338 | 4.635 |
| -3.70000000000022 | -0.091 | 0.338 | 4.634 |
| -3.69600000000022 | -0.092 | 0.339 | 4.632 |
| -3.69200000000022 | -0.092 | 0.34 | 4.631 |
| -3.68800000000022 | -0.092 | 0.34 | 4.629 |
| -3.68400000000022 | -0.093 | 0.341 | 4.627 |
| -3.68000000000022 | -0.093 | 0.342 | 4.626 |
| -3.67600000000022 | -0.093 | 0.342 | 4.624 |
| -3.67200000000022 | -0.093 | 0.343 | 4.623 |
| -3.66800000000022 | -0.094 | 0.343 | 4.621 |
| -3.66400000000022 | -0.094 | 0.344 | 4.619 |
| -3.66000000000022 | -0.094 | 0.345 | 4.617 |
| -3.65600000000022 | -0.094 | 0.345 | 4.616 |
| -3.65200000000022 | -0.095 | 0.346 | 4.614 |
| -3.64800000000022 | -0.095 | 0.347 | 4.612 |
| -3.64400000000022 | -0.095 | 0.347 | 4.61 |
| -3.64000000000022 | -0.096 | 0.348 | 4.609 |
| -3.63600000000022 | -0.096 | 0.348 | 4.607 |
| -3.63200000000022 | -0.096 | 0.349 | 4.605 |
| -3.62800000000022 | -0.096 | 0.35 | 4.603 |
| -3.62400000000022 | -0.097 | 0.35 | 4.601 |
| -3.62000000000022 | -0.097 | 0.351 | 4.599 |
| -3.61600000000022 | -0.097 | 0.352 | 4.597 |
| -3.61200000000022 | -0.098 | 0.352 | 4.595 |
| -3.60800000000022 | -0.098 | 0.353 | 4.593 |
| -3.60400000000022 | -0.098 | 0.353 | 4.591 |
| -3.60000000000022 | -0.098 | 0.354 | 4.589 |
| -3.59600000000022 | -0.099 | 0.355 | 4.587 |
| -3.59200000000022 | -0.099 | 0.355 | 4.585 |
| -3.58800000000022 | -0.099 | 0.356 | 4.583 |
| -3.58400000000022 | -0.1 | 0.357 | 4.581 |
| -3.58000000000022 | -0.1 | 0.357 | 4.579 |
| -3.57600000000022 | -0.1 | 0.358 | 4.577 |
| -3.57200000000022 | -0.1 | 0.359 | 4.575 |
| -3.56800000000022 | -0.101 | 0.359 | 4.572 |
| -3.56400000000022 | -0.101 | 0.36 | 4.57 |
| -3.56000000000022 | -0.101 | 0.36 | 4.568 |
| -3.55600000000022 | -0.102 | 0.361 | 4.566 |
| -3.55200000000022 | -0.102 | 0.362 | 4.563 |
| -3.54800000000022 | -0.102 | 0.362 | 4.561 |
| -3.54400000000022 | -0.102 | 0.363 | 4.559 |
| -3.54000000000022 | -0.103 | 0.364 | 4.556 |
| -3.53600000000022 | -0.103 | 0.364 | 4.554 |
| -3.53200000000022 | -0.103 | 0.365 | 4.552 |
| -3.52800000000022 | -0.104 | 0.365 | 4.549 |
| -3.52400000000022 | -0.104 | 0.366 | 4.547 |
| -3.52000000000022 | -0.104 | 0.367 | 4.544 |
| -3.51600000000022 | -0.104 | 0.367 | 4.542 |
| -3.51200000000022 | -0.105 | 0.368 | 4.539 |
| -3.50800000000022 | -0.105 | 0.369 | 4.537 |
| -3.50400000000022 | -0.105 | 0.369 | 4.534 |
| -3.50000000000022 | -0.106 | 0.37 | 4.531 |
| -3.49600000000022 | -0.106 | 0.371 | 4.529 |
| -3.49200000000022 | -0.106 | 0.371 | 4.526 |
| -3.48800000000022 | -0.107 | 0.372 | 4.524 |
| -3.48400000000022 | -0.107 | 0.372 | 4.521 |
| -3.48000000000022 | -0.107 | 0.373 | 4.518 |
| -3.47600000000022 | -0.108 | 0.374 | 4.516 |
| -3.47200000000022 | -0.108 | 0.374 | 4.513 |
| -3.46800000000022 | -0.108 | 0.375 | 4.51 |
| -3.46400000000022 | -0.108 | 0.376 | 4.507 |
| -3.46000000000022 | -0.109 | 0.376 | 4.504 |
| -3.45600000000022 | -0.109 | 0.377 | 4.502 |
| -3.45200000000022 | -0.109 | 0.378 | 4.499 |
| -3.44800000000022 | -0.11 | 0.378 | 4.496 |
| -3.44400000000022 | -0.11 | 0.379 | 4.493 |
| -3.44000000000022 | -0.11 | 0.379 | 4.49 |
| -3.43600000000022 | -0.111 | 0.38 | 4.487 |
| -3.43200000000022 | -0.111 | 0.381 | 4.484 |
| -3.42800000000022 | -0.111 | 0.381 | 4.481 |
| -3.42400000000022 | -0.112 | 0.382 | 4.478 |
| -3.42000000000022 | -0.112 | 0.383 | 4.475 |
| -3.41600000000022 | -0.112 | 0.383 | 4.472 |
| -3.41200000000022 | -0.113 | 0.384 | 4.469 |
| -3.40800000000022 | -0.113 | 0.385 | 4.466 |
| -3.40400000000022 | -0.113 | 0.385 | 4.463 |
| -3.40000000000022 | -0.113 | 0.386 | 4.46 |
| -3.39600000000022 | -0.114 | 0.386 | 4.457 |
| -3.39200000000022 | -0.114 | 0.387 | 4.453 |
| -3.38800000000022 | -0.114 | 0.388 | 4.45 |
| -3.38400000000022 | -0.115 | 0.388 | 4.447 |
| -3.38000000000022 | -0.115 | 0.389 | 4.444 |
| -3.37600000000022 | -0.115 | 0.39 | 4.44 |
| -3.37200000000022 | -0.116 | 0.39 | 4.437 |
| -3.36800000000022 | -0.116 | 0.391 | 4.434 |
| -3.36400000000022 | -0.116 | 0.392 | 4.431 |
| -3.36000000000022 | -0.117 | 0.392 | 4.427 |
| -3.35600000000022 | -0.117 | 0.393 | 4.424 |
| -3.35200000000022 | -0.117 | 0.393 | 4.42 |
| -3.34800000000022 | -0.118 | 0.394 | 4.417 |
| -3.34400000000022 | -0.118 | 0.395 | 4.414 |
| -3.34000000000022 | -0.118 | 0.395 | 4.41 |
| -3.33600000000022 | -0.119 | 0.396 | 4.407 |
| -3.33200000000022 | -0.119 | 0.397 | 4.403 |
| -3.32800000000022 | -0.119 | 0.397 | 4.399 |
| -3.32400000000022 | -0.12 | 0.398 | 4.396 |
| -3.32000000000022 | -0.12 | 0.398 | 4.392 |
| -3.31600000000022 | -0.12 | 0.399 | 4.389 |
| -3.31200000000022 | -0.121 | 0.4 | 4.385 |
| -3.30800000000022 | -0.121 | 0.4 | 4.381 |
| -3.30400000000022 | -0.121 | 0.401 | 4.378 |
| -3.30000000000022 | -0.122 | 0.402 | 4.374 |
| -3.29600000000022 | -0.122 | 0.402 | 4.37 |
| -3.29200000000022 | -0.122 | 0.403 | 4.367 |
| -3.28800000000022 | -0.123 | 0.404 | 4.363 |
| -3.28400000000022 | -0.123 | 0.404 | 4.359 |
| -3.28000000000022 | -0.123 | 0.405 | 4.355 |
| -3.27600000000022 | -0.124 | 0.405 | 4.351 |
| -3.27200000000022 | -0.124 | 0.406 | 4.348 |
| -3.26800000000022 | -0.124 | 0.407 | 4.344 |
| -3.26400000000022 | -0.125 | 0.407 | 4.34 |
| -3.26000000000022 | -0.125 | 0.408 | 4.336 |
| -3.25600000000022 | -0.125 | 0.409 | 4.332 |
| -3.25200000000022 | -0.126 | 0.409 | 4.328 |
| -3.24800000000022 | -0.126 | 0.41 | 4.324 |
| -3.24400000000022 | -0.127 | 0.41 | 4.32 |
| -3.24000000000022 | -0.127 | 0.411 | 4.316 |
| -3.23600000000022 | -0.127 | 0.412 | 4.312 |
| -3.23200000000022 | -0.128 | 0.412 | 4.308 |
| -3.22800000000022 | -0.128 | 0.413 | 4.304 |
| -3.22400000000022 | -0.128 | 0.414 | 4.299 |
| -3.22000000000022 | -0.129 | 0.414 | 4.295 |
| -3.21600000000022 | -0.129 | 0.415 | 4.291 |
| -3.21200000000022 | -0.129 | 0.416 | 4.287 |
| -3.20800000000022 | -0.13 | 0.416 | 4.283 |
| -3.20400000000022 | -0.13 | 0.417 | 4.278 |
| -3.20000000000022 | -0.13 | 0.417 | 4.274 |
| -3.19600000000022 | -0.131 | 0.418 | 4.27 |
| -3.19200000000022 | -0.131 | 0.419 | 4.266 |
| -3.18800000000022 | -0.132 | 0.419 | 4.261 |
| -3.18400000000022 | -0.132 | 0.42 | 4.257 |
| -3.18000000000022 | -0.132 | 0.421 | 4.253 |
| -3.17600000000022 | -0.133 | 0.421 | 4.248 |
| -3.17200000000022 | -0.133 | 0.422 | 4.244 |
| -3.16800000000022 | -0.133 | 0.422 | 4.239 |
| -3.16400000000022 | -0.134 | 0.423 | 4.235 |
| -3.16000000000022 | -0.134 | 0.424 | 4.23 |
| -3.15600000000022 | -0.134 | 0.424 | 4.226 |
| -3.152000000000219 | -0.135 | 0.425 | 4.221 |
| -3.148000000000219 | -0.135 | 0.426 | 4.217 |
| -3.144000000000219 | -0.136 | 0.426 | 4.212 |
| -3.140000000000219 | -0.136 | 0.427 | 4.208 |
| -3.136000000000219 | -0.136 | 0.427 | 4.203 |
| -3.132000000000219 | -0.137 | 0.428 | 4.198 |
| -3.128000000000219 | -0.137 | 0.429 | 4.194 |
| -3.124000000000219 | -0.137 | 0.429 | 4.189 |
| -3.120000000000219 | -0.138 | 0.43 | 4.184 |
| -3.116000000000219 | -0.138 | 0.43 | 4.18 |
| -3.112000000000219 | -0.139 | 0.431 | 4.175 |
| -3.108000000000219 | -0.139 | 0.432 | 4.17 |
| -3.104000000000219 | -0.139 | 0.432 | 4.165 |
| -3.100000000000219 | -0.14 | 0.433 | 4.16 |
| -3.096000000000219 | -0.14 | 0.434 | 4.156 |
| -3.092000000000219 | -0.14 | 0.434 | 4.151 |
| -3.088000000000219 | -0.141 | 0.435 | 4.146 |
| -3.084000000000219 | -0.141 | 0.435 | 4.141 |
| -3.080000000000219 | -0.142 | 0.436 | 4.136 |
| -3.076000000000219 | -0.142 | 0.437 | 4.131 |
| -3.072000000000219 | -0.142 | 0.437 | 4.126 |
| -3.068000000000219 | -0.143 | 0.438 | 4.121 |
| -3.064000000000219 | -0.143 | 0.438 | 4.116 |
| -3.060000000000219 | -0.143 | 0.439 | 4.111 |
| -3.056000000000219 | -0.144 | 0.44 | 4.106 |
| -3.052000000000219 | -0.144 | 0.44 | 4.101 |
| -3.048000000000219 | -0.145 | 0.441 | 4.096 |
| -3.044000000000219 | -0.145 | 0.441 | 4.091 |
| -3.040000000000219 | -0.145 | 0.442 | 4.085 |
| -3.036000000000219 | -0.146 | 0.443 | 4.08 |
| -3.032000000000219 | -0.146 | 0.443 | 4.075 |
| -3.028000000000219 | -0.147 | 0.444 | 4.07 |
| -3.024000000000219 | -0.147 | 0.444 | 4.065 |
| -3.020000000000219 | -0.147 | 0.445 | 4.059 |
| -3.016000000000219 | -0.148 | 0.446 | 4.054 |
| -3.012000000000219 | -0.148 | 0.446 | 4.049 |
| -3.008000000000219 | -0.149 | 0.447 | 4.043 |
| -3.004000000000219 | -0.149 | 0.447 | 4.038 |
| -3.000000000000219 | -0.149 | 0.448 | 4.033 |
| -2.996000000000219 | -0.15 | 0.449 | 4.027 |
| -2.992000000000219 | -0.15 | 0.449 | 4.022 |
| -2.988000000000219 | -0.151 | 0.45 | 4.017 |
| -2.984000000000219 | -0.151 | 0.45 | 4.011 |
| -2.980000000000219 | -0.151 | 0.451 | 4.006 |
| -2.976000000000219 | -0.152 | 0.452 | 4 |
| -2.972000000000219 | -0.152 | 0.452 | 3.995 |
| -2.968000000000219 | -0.153 | 0.453 | 3.989 |
| -2.964000000000219 | -0.153 | 0.453 | 3.983 |
| -2.960000000000219 | -0.153 | 0.454 | 3.978 |
| -2.956000000000219 | -0.154 | 0.455 | 3.972 |
| -2.952000000000219 | -0.154 | 0.455 | 3.967 |
| -2.948000000000219 | -0.155 | 0.456 | 3.961 |
| -2.944000000000219 | -0.155 | 0.456 | 3.955 |
| -2.940000000000219 | -0.155 | 0.457 | 3.95 |
| -2.936000000000219 | -0.156 | 0.458 | 3.944 |
| -2.932000000000219 | -0.156 | 0.458 | 3.938 |
| -2.928000000000219 | -0.157 | 0.459 | 3.933 |
| -2.924000000000219 | -0.157 | 0.459 | 3.927 |
| -2.920000000000219 | -0.157 | 0.46 | 3.921 |
| -2.916000000000219 | -0.158 | 0.46 | 3.915 |
| -2.912000000000219 | -0.158 | 0.461 | 3.909 |
| -2.908000000000219 | -0.159 | 0.462 | 3.903 |
| -2.904000000000219 | -0.159 | 0.462 | 3.898 |
| -2.900000000000219 | -0.16 | 0.463 | 3.892 |
| -2.896000000000219 | -0.16 | 0.463 | 3.886 |
| -2.892000000000219 | -0.16 | 0.464 | 3.88 |
| -2.888000000000219 | -0.161 | 0.464 | 3.874 |
| -2.884000000000219 | -0.161 | 0.465 | 3.868 |
| -2.880000000000219 | -0.162 | 0.466 | 3.862 |
| -2.876000000000219 | -0.162 | 0.466 | 3.856 |
| -2.872000000000219 | -0.163 | 0.467 | 3.85 |
| -2.868000000000219 | -0.163 | 0.467 | 3.844 |
| -2.864000000000219 | -0.163 | 0.468 | 3.838 |
| -2.860000000000219 | -0.164 | 0.468 | 3.832 |
| -2.856000000000219 | -0.164 | 0.469 | 3.825 |
| -2.852000000000219 | -0.165 | 0.47 | 3.819 |
| -2.848000000000219 | -0.165 | 0.47 | 3.813 |
| -2.844000000000219 | -0.165 | 0.471 | 3.807 |
| -2.840000000000219 | -0.166 | 0.471 | 3.801 |
| -2.836000000000219 | -0.166 | 0.472 | 3.795 |
| -2.832000000000219 | -0.167 | 0.472 | 3.788 |
| -2.828000000000219 | -0.167 | 0.473 | 3.782 |
| -2.824000000000219 | -0.168 | 0.473 | 3.776 |
| -2.820000000000219 | -0.168 | 0.474 | 3.77 |
| -2.816000000000219 | -0.169 | 0.475 | 3.763 |
| -2.812000000000219 | -0.169 | 0.475 | 3.757 |
| -2.808000000000219 | -0.169 | 0.476 | 3.751 |
| -2.804000000000219 | -0.17 | 0.476 | 3.744 |
| -2.800000000000219 | -0.17 | 0.477 | 3.738 |
| -2.796000000000219 | -0.171 | 0.477 | 3.731 |
| -2.792000000000219 | -0.171 | 0.478 | 3.725 |
| -2.78800000000022 | -0.172 | 0.478 | 3.718 |
| -2.78400000000022 | -0.172 | 0.479 | 3.712 |
| -2.78000000000022 | -0.172 | 0.479 | 3.705 |
| -2.776000000000219 | -0.173 | 0.48 | 3.699 |
| -2.772000000000219 | -0.173 | 0.481 | 3.692 |
| -2.76800000000022 | -0.174 | 0.481 | 3.686 |
| -2.76400000000022 | -0.174 | 0.482 | 3.679 |
| -2.76000000000022 | -0.175 | 0.482 | 3.673 |
| -2.756000000000219 | -0.175 | 0.483 | 3.666 |
| -2.752000000000219 | -0.176 | 0.483 | 3.659 |
| -2.74800000000022 | -0.176 | 0.484 | 3.653 |
| -2.74400000000022 | -0.176 | 0.484 | 3.646 |
| -2.74000000000022 | -0.177 | 0.485 | 3.639 |
| -2.736000000000219 | -0.177 | 0.485 | 3.633 |
| -2.732000000000219 | -0.178 | 0.486 | 3.626 |
| -2.72800000000022 | -0.178 | 0.486 | 3.619 |
| -2.72400000000022 | -0.179 | 0.487 | 3.613 |
| -2.72000000000022 | -0.179 | 0.487 | 3.606 |
| -2.716000000000219 | -0.18 | 0.488 | 3.599 |
| -2.712000000000219 | -0.18 | 0.488 | 3.592 |
| -2.70800000000022 | -0.181 | 0.489 | 3.585 |
| -2.70400000000022 | -0.181 | 0.489 | 3.578 |
| -2.70000000000022 | -0.181 | 0.49 | 3.572 |
| -2.696000000000219 | -0.182 | 0.49 | 3.565 |
| -2.692000000000219 | -0.182 | 0.491 | 3.558 |
| -2.688000000000219 | -0.183 | 0.491 | 3.551 |
| -2.684000000000219 | -0.183 | 0.492 | 3.544 |
| -2.680000000000219 | -0.184 | 0.492 | 3.537 |
| -2.676000000000219 | -0.184 | 0.493 | 3.53 |
| -2.672000000000219 | -0.185 | 0.493 | 3.523 |
| -2.668000000000219 | -0.185 | 0.494 | 3.516 |
| -2.664000000000219 | -0.186 | 0.494 | 3.509 |
| -2.660000000000219 | -0.186 | 0.495 | 3.502 |
| -2.656000000000219 | -0.187 | 0.495 | 3.495 |
| -2.652000000000219 | -0.187 | 0.496 | 3.488 |
| -2.648000000000219 | -0.187 | 0.496 | 3.481 |
| -2.644000000000219 | -0.188 | 0.497 | 3.474 |
| -2.640000000000219 | -0.188 | 0.497 | 3.466 |
| -2.636000000000219 | -0.189 | 0.498 | 3.459 |
| -2.632000000000219 | -0.189 | 0.498 | 3.452 |
| -2.628000000000219 | -0.19 | 0.499 | 3.445 |
| -2.624000000000219 | -0.19 | 0.499 | 3.438 |
| -2.620000000000219 | -0.191 | 0.5 | 3.43 |
| -2.616000000000219 | -0.191 | 0.5 | 3.423 |
| -2.612000000000219 | -0.192 | 0.501 | 3.416 |
| -2.608000000000219 | -0.192 | 0.501 | 3.409 |
| -2.604000000000219 | -0.193 | 0.502 | 3.401 |
| -2.600000000000219 | -0.193 | 0.502 | 3.394 |
| -2.596000000000219 | -0.194 | 0.503 | 3.387 |
| -2.592000000000219 | -0.194 | 0.503 | 3.379 |
| -2.588000000000219 | -0.195 | 0.503 | 3.372 |
| -2.584000000000219 | -0.195 | 0.504 | 3.365 |
| -2.580000000000219 | -0.195 | 0.504 | 3.357 |
| -2.576000000000219 | -0.196 | 0.505 | 3.35 |
| -2.572000000000219 | -0.196 | 0.505 | 3.343 |
| -2.568000000000219 | -0.197 | 0.506 | 3.335 |
| -2.564000000000219 | -0.197 | 0.506 | 3.328 |
| -2.560000000000219 | -0.198 | 0.507 | 3.32 |
| -2.556000000000219 | -0.198 | 0.507 | 3.313 |
| -2.552000000000219 | -0.199 | 0.508 | 3.305 |
| -2.548000000000219 | -0.199 | 0.508 | 3.298 |
| -2.544000000000219 | -0.2 | 0.508 | 3.29 |
| -2.540000000000219 | -0.2 | 0.509 | 3.283 |
| -2.536000000000219 | -0.201 | 0.509 | 3.275 |
| -2.532000000000219 | -0.201 | 0.51 | 3.268 |
| -2.528000000000219 | -0.202 | 0.51 | 3.26 |
| -2.524000000000219 | -0.202 | 0.511 | 3.252 |
| -2.520000000000219 | -0.203 | 0.511 | 3.245 |
| -2.516000000000219 | -0.203 | 0.511 | 3.237 |
| -2.512000000000219 | -0.204 | 0.512 | 3.229 |
| -2.508000000000219 | -0.204 | 0.512 | 3.222 |
| -2.504000000000219 | -0.205 | 0.513 | 3.214 |
| -2.500000000000219 | -0.205 | 0.513 | 3.206 |
| -2.496000000000219 | -0.206 | 0.513 | 3.199 |
| -2.492000000000219 | -0.206 | 0.514 | 3.191 |
| -2.488000000000219 | -0.207 | 0.514 | 3.183 |
| -2.484000000000219 | -0.207 | 0.515 | 3.176 |
| -2.480000000000219 | -0.208 | 0.515 | 3.168 |
| -2.476000000000219 | -0.208 | 0.515 | 3.16 |
| -2.472000000000219 | -0.209 | 0.516 | 3.152 |
| -2.468000000000219 | -0.209 | 0.516 | 3.144 |
| -2.464000000000219 | -0.21 | 0.517 | 3.137 |
| -2.460000000000219 | -0.21 | 0.517 | 3.129 |
| -2.456000000000219 | -0.211 | 0.517 | 3.121 |
| -2.452000000000219 | -0.211 | 0.518 | 3.113 |
| -2.448000000000219 | -0.212 | 0.518 | 3.105 |
| -2.444000000000219 | -0.212 | 0.519 | 3.097 |
| -2.440000000000219 | -0.213 | 0.519 | 3.089 |
| -2.436000000000219 | -0.213 | 0.519 | 3.082 |
| -2.432000000000219 | -0.214 | 0.52 | 3.074 |
| -2.428000000000219 | -0.214 | 0.52 | 3.066 |
| -2.424000000000219 | -0.215 | 0.52 | 3.058 |
| -2.420000000000219 | -0.215 | 0.521 | 3.05 |
| -2.416000000000219 | -0.216 | 0.521 | 3.042 |
| -2.412000000000219 | -0.216 | 0.521 | 3.034 |
| -2.408000000000219 | -0.217 | 0.522 | 3.026 |
| -2.404000000000219 | -0.217 | 0.522 | 3.018 |
| -2.400000000000219 | -0.218 | 0.523 | 3.01 |
| -2.396000000000219 | -0.218 | 0.523 | 3.002 |
| -2.392000000000219 | -0.219 | 0.523 | 2.994 |
| -2.388000000000219 | -0.219 | 0.524 | 2.986 |
| -2.384000000000219 | -0.22 | 0.524 | 2.978 |
| -2.380000000000219 | -0.22 | 0.524 | 2.97 |
| -2.376000000000219 | -0.221 | 0.525 | 2.961 |
| -2.372000000000219 | -0.221 | 0.525 | 2.953 |
| -2.368000000000219 | -0.222 | 0.525 | 2.945 |
| -2.364000000000219 | -0.222 | 0.526 | 2.937 |
| -2.360000000000219 | -0.223 | 0.526 | 2.929 |
| -2.356000000000219 | -0.223 | 0.526 | 2.921 |
| -2.352000000000219 | -0.224 | 0.527 | 2.913 |
| -2.348000000000219 | -0.224 | 0.527 | 2.904 |
| -2.344000000000219 | -0.225 | 0.527 | 2.896 |
| -2.340000000000219 | -0.225 | 0.527 | 2.888 |
| -2.336000000000219 | -0.226 | 0.528 | 2.88 |
| -2.332000000000219 | -0.226 | 0.528 | 2.872 |
| -2.328000000000219 | -0.227 | 0.528 | 2.863 |
| -2.324000000000219 | -0.227 | 0.529 | 2.855 |
| -2.320000000000219 | -0.228 | 0.529 | 2.847 |
| -2.316000000000219 | -0.229 | 0.529 | 2.839 |
| -2.312000000000219 | -0.229 | 0.53 | 2.83 |
| -2.308000000000219 | -0.23 | 0.53 | 2.822 |
| -2.304000000000219 | -0.23 | 0.53 | 2.814 |
| -2.300000000000219 | -0.231 | 0.53 | 2.806 |
| -2.296000000000219 | -0.231 | 0.531 | 2.797 |
| -2.292000000000219 | -0.232 | 0.531 | 2.789 |
| -2.288000000000219 | -0.232 | 0.531 | 2.781 |
| -2.284000000000219 | -0.233 | 0.531 | 2.772 |
| -2.280000000000219 | -0.233 | 0.532 | 2.764 |
| -2.276000000000219 | -0.234 | 0.532 | 2.756 |
| -2.272000000000219 | -0.234 | 0.532 | 2.747 |
| -2.268000000000219 | -0.235 | 0.532 | 2.739 |
| -2.264000000000219 | -0.235 | 0.533 | 2.731 |
| -2.260000000000219 | -0.236 | 0.533 | 2.722 |
| -2.256000000000219 | -0.236 | 0.533 | 2.714 |
| -2.252000000000219 | -0.237 | 0.533 | 2.705 |
| -2.248000000000219 | -0.237 | 0.534 | 2.697 |
| -2.244000000000219 | -0.238 | 0.534 | 2.689 |
| -2.240000000000219 | -0.238 | 0.534 | 2.68 |
| -2.236000000000219 | -0.239 | 0.534 | 2.672 |
| -2.232000000000219 | -0.24 | 0.535 | 2.663 |
| -2.228000000000219 | -0.24 | 0.535 | 2.655 |
| -2.224000000000219 | -0.241 | 0.535 | 2.646 |
| -2.220000000000219 | -0.241 | 0.535 | 2.638 |
| -2.216000000000219 | -0.242 | 0.535 | 2.63 |
| -2.212000000000219 | -0.242 | 0.536 | 2.621 |
| -2.208000000000219 | -0.243 | 0.536 | 2.613 |
| -2.204000000000219 | -0.243 | 0.536 | 2.604 |
| -2.200000000000219 | -0.244 | 0.536 | 2.596 |
| -2.196000000000219 | -0.244 | 0.536 | 2.587 |
| -2.192000000000219 | -0.245 | 0.537 | 2.579 |
| -2.188000000000219 | -0.245 | 0.537 | 2.57 |
| -2.184000000000219 | -0.246 | 0.537 | 2.562 |
| -2.180000000000219 | -0.246 | 0.537 | 2.553 |
| -2.176000000000219 | -0.247 | 0.537 | 2.545 |
| -2.172000000000219 | -0.247 | 0.538 | 2.536 |
| -2.168000000000219 | -0.248 | 0.538 | 2.527 |
| -2.164000000000219 | -0.249 | 0.538 | 2.519 |
| -2.160000000000219 | -0.249 | 0.538 | 2.51 |
| -2.156000000000219 | -0.25 | 0.538 | 2.502 |
| -2.152000000000219 | -0.25 | 0.538 | 2.493 |
| -2.148000000000219 | -0.251 | 0.539 | 2.485 |
| -2.144000000000219 | -0.251 | 0.539 | 2.476 |
| -2.140000000000219 | -0.252 | 0.539 | 2.468 |
| -2.136000000000219 | -0.252 | 0.539 | 2.459 |
| -2.132000000000219 | -0.253 | 0.539 | 2.45 |
| -2.128000000000219 | -0.253 | 0.539 | 2.442 |
| -2.124000000000219 | -0.254 | 0.539 | 2.433 |
| -2.120000000000219 | -0.254 | 0.539 | 2.425 |
| -2.116000000000219 | -0.255 | 0.54 | 2.416 |
| -2.112000000000219 | -0.256 | 0.54 | 2.407 |
| -2.108000000000219 | -0.256 | 0.54 | 2.399 |
| -2.104000000000219 | -0.257 | 0.54 | 2.39 |
| -2.100000000000219 | -0.257 | 0.54 | 2.382 |
| -2.096000000000219 | -0.258 | 0.54 | 2.373 |
| -2.092000000000219 | -0.258 | 0.54 | 2.364 |
| -2.088000000000219 | -0.259 | 0.54 | 2.356 |
| -2.084000000000219 | -0.259 | 0.54 | 2.347 |
| -2.080000000000219 | -0.26 | 0.54 | 2.338 |
| -2.076000000000219 | -0.26 | 0.541 | 2.33 |
| -2.072000000000219 | -0.261 | 0.541 | 2.321 |
| -2.068000000000219 | -0.261 | 0.541 | 2.312 |
| -2.064000000000219 | -0.262 | 0.541 | 2.304 |
| -2.060000000000219 | -0.263 | 0.541 | 2.295 |
| -2.056000000000219 | -0.263 | 0.541 | 2.287 |
| -2.052000000000219 | -0.264 | 0.541 | 2.278 |
| -2.048000000000219 | -0.264 | 0.541 | 2.269 |
| -2.044000000000219 | -0.265 | 0.541 | 2.261 |
| -2.040000000000219 | -0.265 | 0.541 | 2.252 |
| -2.036000000000219 | -0.266 | 0.541 | 2.243 |
| -2.032000000000219 | -0.266 | 0.541 | 2.235 |
| -2.028000000000219 | -0.267 | 0.541 | 2.226 |
| -2.024000000000219 | -0.267 | 0.541 | 2.217 |
| -2.020000000000219 | -0.268 | 0.541 | 2.209 |
| -2.016000000000219 | -0.269 | 0.541 | 2.2 |
| -2.012000000000219 | -0.269 | 0.541 | 2.191 |
| -2.008000000000218 | -0.27 | 0.541 | 2.183 |
| -2.004000000000218 | -0.27 | 0.541 | 2.174 |
| -2.000000000000218 | -0.271 | 0.541 | 2.165 |
| -1.996000000000218 | -0.271 | 0.541 | 2.157 |
| -1.992000000000218 | -0.272 | 0.541 | 2.148 |
| -1.988000000000218 | -0.272 | 0.541 | 2.139 |
| -1.984000000000218 | -0.273 | 0.541 | 2.131 |
| -1.980000000000218 | -0.273 | 0.541 | 2.122 |
| -1.976000000000218 | -0.274 | 0.541 | 2.113 |
| -1.972000000000218 | -0.274 | 0.541 | 2.105 |
| -1.968000000000218 | -0.275 | 0.541 | 2.096 |
| -1.964000000000218 | -0.276 | 0.541 | 2.087 |
| -1.960000000000218 | -0.276 | 0.541 | 2.079 |
| -1.956000000000218 | -0.277 | 0.541 | 2.07 |
| -1.952000000000218 | -0.277 | 0.541 | 2.061 |
| -1.948000000000218 | -0.278 | 0.541 | 2.053 |
| -1.944000000000218 | -0.278 | 0.541 | 2.044 |
| -1.940000000000218 | -0.279 | 0.541 | 2.036 |
| -1.936000000000218 | -0.279 | 0.541 | 2.027 |
| -1.932000000000218 | -0.28 | 0.541 | 2.018 |
| -1.928000000000218 | -0.28 | 0.541 | 2.01 |
| -1.924000000000218 | -0.281 | 0.541 | 2.001 |
| -1.920000000000218 | -0.281 | 0.54 | 1.992 |
| -1.916000000000218 | -0.282 | 0.54 | 1.984 |
| -1.912000000000218 | -0.283 | 0.54 | 1.975 |
| -1.908000000000218 | -0.283 | 0.54 | 1.966 |
| -1.904000000000218 | -0.284 | 0.54 | 1.958 |
| -1.900000000000218 | -0.284 | 0.54 | 1.949 |
| -1.896000000000218 | -0.285 | 0.54 | 1.941 |
| -1.892000000000218 | -0.285 | 0.54 | 1.932 |
| -1.888000000000218 | -0.286 | 0.54 | 1.923 |
| -1.884000000000218 | -0.286 | 0.539 | 1.915 |
| -1.880000000000218 | -0.287 | 0.539 | 1.906 |
| -1.876000000000218 | -0.287 | 0.539 | 1.898 |
| -1.872000000000218 | -0.288 | 0.539 | 1.889 |
| -1.868000000000218 | -0.288 | 0.539 | 1.88 |
| -1.864000000000218 | -0.289 | 0.539 | 1.872 |
| -1.860000000000218 | -0.29 | 0.539 | 1.863 |
| -1.856000000000218 | -0.29 | 0.538 | 1.855 |
| -1.852000000000218 | -0.291 | 0.538 | 1.846 |
| -1.848000000000218 | -0.291 | 0.538 | 1.838 |
| -1.844000000000218 | -0.292 | 0.538 | 1.829 |
| -1.840000000000218 | -0.292 | 0.538 | 1.82 |
| -1.836000000000218 | -0.293 | 0.538 | 1.812 |
| -1.832000000000218 | -0.293 | 0.537 | 1.803 |
| -1.828000000000218 | -0.294 | 0.537 | 1.795 |
| -1.824000000000218 | -0.294 | 0.537 | 1.786 |
| -1.820000000000218 | -0.295 | 0.537 | 1.778 |
| -1.816000000000218 | -0.295 | 0.536 | 1.769 |
| -1.812000000000218 | -0.296 | 0.536 | 1.761 |
| -1.808000000000218 | -0.296 | 0.536 | 1.752 |
| -1.804000000000218 | -0.297 | 0.536 | 1.744 |
| -1.800000000000218 | -0.298 | 0.536 | 1.735 |
| -1.796000000000218 | -0.298 | 0.535 | 1.727 |
| -1.792000000000218 | -0.299 | 0.535 | 1.718 |
| -1.788000000000218 | -0.299 | 0.535 | 1.71 |
| -1.784000000000218 | -0.3 | 0.535 | 1.701 |
| -1.780000000000218 | -0.3 | 0.534 | 1.693 |
| -1.776000000000218 | -0.301 | 0.534 | 1.684 |
| -1.772000000000218 | -0.301 | 0.534 | 1.676 |
| -1.768000000000218 | -0.302 | 0.533 | 1.668 |
| -1.764000000000218 | -0.302 | 0.533 | 1.659 |
| -1.760000000000218 | -0.303 | 0.533 | 1.651 |
| -1.756000000000218 | -0.303 | 0.533 | 1.642 |
| -1.752000000000218 | -0.304 | 0.532 | 1.634 |
| -1.748000000000218 | -0.304 | 0.532 | 1.626 |
| -1.744000000000218 | -0.305 | 0.532 | 1.617 |
| -1.740000000000218 | -0.305 | 0.531 | 1.609 |
| -1.736000000000218 | -0.306 | 0.531 | 1.601 |
| -1.732000000000218 | -0.306 | 0.531 | 1.592 |
| -1.728000000000218 | -0.307 | 0.53 | 1.584 |
| -1.724000000000218 | -0.307 | 0.53 | 1.576 |
| -1.720000000000218 | -0.308 | 0.53 | 1.567 |
| -1.716000000000218 | -0.309 | 0.529 | 1.559 |
| -1.712000000000218 | -0.309 | 0.529 | 1.551 |
| -1.708000000000218 | -0.31 | 0.529 | 1.542 |
| -1.704000000000218 | -0.31 | 0.528 | 1.534 |
| -1.700000000000218 | -0.311 | 0.528 | 1.526 |
| -1.696000000000218 | -0.311 | 0.528 | 1.518 |
| -1.692000000000218 | -0.312 | 0.527 | 1.509 |
| -1.688000000000218 | -0.312 | 0.527 | 1.501 |
| -1.684000000000218 | -0.313 | 0.526 | 1.493 |
| -1.680000000000218 | -0.313 | 0.526 | 1.485 |
| -1.676000000000218 | -0.314 | 0.526 | 1.476 |
| -1.672000000000218 | -0.314 | 0.525 | 1.468 |
| -1.668000000000218 | -0.315 | 0.525 | 1.46 |
| -1.664000000000218 | -0.315 | 0.524 | 1.452 |
| -1.660000000000218 | -0.316 | 0.524 | 1.444 |
| -1.656000000000218 | -0.316 | 0.524 | 1.436 |
| -1.652000000000218 | -0.317 | 0.523 | 1.428 |
| -1.648000000000218 | -0.317 | 0.523 | 1.419 |
| -1.644000000000218 | -0.318 | 0.522 | 1.411 |
| -1.640000000000218 | -0.318 | 0.522 | 1.403 |
| -1.636000000000218 | -0.319 | 0.521 | 1.395 |
| -1.632000000000218 | -0.319 | 0.521 | 1.387 |
| -1.628000000000218 | -0.32 | 0.52 | 1.379 |
| -1.624000000000218 | -0.32 | 0.52 | 1.371 |
| -1.620000000000218 | -0.321 | 0.519 | 1.363 |
| -1.616000000000218 | -0.321 | 0.519 | 1.355 |
| -1.612000000000218 | -0.322 | 0.518 | 1.347 |
| -1.608000000000218 | -0.322 | 0.518 | 1.339 |
| -1.604000000000218 | -0.323 | 0.517 | 1.331 |
| -1.600000000000218 | -0.323 | 0.517 | 1.323 |
| -1.596000000000218 | -0.324 | 0.516 | 1.315 |
| -1.592000000000218 | -0.324 | 0.516 | 1.307 |
| -1.588000000000218 | -0.324 | 0.515 | 1.299 |
| -1.584000000000218 | -0.325 | 0.515 | 1.292 |
| -1.580000000000218 | -0.325 | 0.514 | 1.284 |
| -1.576000000000218 | -0.326 | 0.514 | 1.276 |
| -1.572000000000218 | -0.326 | 0.513 | 1.268 |
| -1.568000000000218 | -0.327 | 0.513 | 1.26 |
| -1.564000000000218 | -0.327 | 0.512 | 1.252 |
| -1.560000000000218 | -0.328 | 0.511 | 1.245 |
| -1.556000000000218 | -0.328 | 0.511 | 1.237 |
| -1.552000000000218 | -0.329 | 0.51 | 1.229 |
| -1.548000000000218 | -0.329 | 0.51 | 1.221 |
| -1.544000000000218 | -0.33 | 0.509 | 1.213 |
| -1.540000000000218 | -0.33 | 0.508 | 1.206 |
| -1.536000000000218 | -0.331 | 0.508 | 1.198 |
| -1.532000000000218 | -0.331 | 0.507 | 1.19 |
| -1.528000000000218 | -0.332 | 0.507 | 1.183 |
| -1.524000000000218 | -0.332 | 0.506 | 1.175 |
| -1.520000000000218 | -0.332 | 0.505 | 1.167 |
| -1.516000000000218 | -0.333 | 0.505 | 1.16 |
| -1.512000000000218 | -0.333 | 0.504 | 1.152 |
| -1.508000000000218 | -0.334 | 0.503 | 1.145 |
| -1.504000000000218 | -0.334 | 0.503 | 1.137 |
| -1.500000000000218 | -0.335 | 0.502 | 1.13 |
| -1.496000000000218 | -0.335 | 0.501 | 1.122 |
| -1.492000000000218 | -0.336 | 0.501 | 1.115 |
| -1.488000000000218 | -0.336 | 0.5 | 1.107 |
| -1.484000000000218 | -0.336 | 0.499 | 1.1 |
| -1.480000000000218 | -0.337 | 0.499 | 1.092 |
| -1.476000000000218 | -0.337 | 0.498 | 1.085 |
| -1.472000000000218 | -0.338 | 0.497 | 1.077 |
| -1.468000000000218 | -0.338 | 0.496 | 1.07 |
| -1.464000000000218 | -0.339 | 0.496 | 1.063 |
| -1.460000000000218 | -0.339 | 0.495 | 1.055 |
| -1.456000000000218 | -0.339 | 0.494 | 1.048 |
| -1.452000000000218 | -0.34 | 0.494 | 1.041 |
| -1.448000000000218 | -0.34 | 0.493 | 1.033 |
| -1.444000000000218 | -0.341 | 0.492 | 1.026 |
| -1.440000000000218 | -0.341 | 0.491 | 1.019 |
| -1.436000000000218 | -0.342 | 0.491 | 1.012 |
| -1.432000000000218 | -0.342 | 0.49 | 1.004 |
| -1.428000000000218 | -0.342 | 0.489 | 0.997 |
| -1.424000000000218 | -0.343 | 0.488 | 0.99 |
| -1.420000000000218 | -0.343 | 0.487 | 0.983 |
| -1.416000000000218 | -0.344 | 0.487 | 0.976 |
| -1.412000000000218 | -0.344 | 0.486 | 0.969 |
| -1.408000000000218 | -0.344 | 0.485 | 0.961 |
| -1.404000000000218 | -0.345 | 0.484 | 0.954 |
| -1.400000000000218 | -0.345 | 0.483 | 0.947 |
| -1.396000000000218 | -0.346 | 0.482 | 0.94 |
| -1.392000000000218 | -0.346 | 0.482 | 0.933 |
| -1.388000000000218 | -0.346 | 0.481 | 0.926 |
| -1.384000000000218 | -0.347 | 0.48 | 0.919 |
| -1.380000000000218 | -0.347 | 0.479 | 0.912 |
| -1.376000000000218 | -0.348 | 0.478 | 0.905 |
| -1.372000000000218 | -0.348 | 0.477 | 0.899 |
| -1.368000000000218 | -0.348 | 0.476 | 0.892 |
| -1.364000000000218 | -0.349 | 0.476 | 0.885 |
| -1.360000000000218 | -0.349 | 0.475 | 0.878 |
| -1.356000000000218 | -0.349 | 0.474 | 0.871 |
| -1.352000000000218 | -0.35 | 0.473 | 0.864 |
| -1.348000000000218 | -0.35 | 0.472 | 0.858 |
| -1.344000000000218 | -0.351 | 0.471 | 0.851 |
| -1.340000000000218 | -0.351 | 0.47 | 0.844 |
| -1.336000000000218 | -0.351 | 0.469 | 0.838 |
| -1.332000000000218 | -0.352 | 0.468 | 0.831 |
| -1.328000000000218 | -0.352 | 0.467 | 0.824 |
| -1.324000000000218 | -0.352 | 0.466 | 0.818 |
| -1.320000000000218 | -0.353 | 0.465 | 0.811 |
| -1.316000000000218 | -0.353 | 0.464 | 0.804 |
| -1.312000000000218 | -0.353 | 0.464 | 0.798 |
| -1.308000000000218 | -0.354 | 0.463 | 0.791 |
| -1.304000000000218 | -0.354 | 0.462 | 0.785 |
| -1.300000000000218 | -0.354 | 0.461 | 0.778 |
| -1.296000000000218 | -0.355 | 0.46 | 0.772 |
| -1.292000000000218 | -0.355 | 0.459 | 0.765 |
| -1.288000000000218 | -0.355 | 0.458 | 0.759 |
| -1.284000000000218 | -0.356 | 0.457 | 0.753 |
| -1.280000000000218 | -0.356 | 0.456 | 0.746 |
| -1.276000000000218 | -0.356 | 0.455 | 0.74 |
| -1.272000000000218 | -0.357 | 0.453 | 0.734 |
| -1.268000000000218 | -0.357 | 0.452 | 0.727 |
| -1.264000000000218 | -0.357 | 0.451 | 0.721 |
| -1.260000000000218 | -0.357 | 0.45 | 0.715 |
| -1.256000000000218 | -0.358 | 0.449 | 0.709 |
| -1.252000000000218 | -0.358 | 0.448 | 0.703 |
| -1.248000000000218 | -0.358 | 0.447 | 0.696 |
| -1.244000000000218 | -0.359 | 0.446 | 0.69 |
| -1.240000000000218 | -0.359 | 0.445 | 0.684 |
| -1.236000000000218 | -0.359 | 0.444 | 0.678 |
| -1.232000000000218 | -0.359 | 0.443 | 0.672 |
| -1.228000000000218 | -0.36 | 0.442 | 0.666 |
| -1.224000000000218 | -0.36 | 0.441 | 0.66 |
| -1.220000000000218 | -0.36 | 0.439 | 0.654 |
| -1.216000000000218 | -0.36 | 0.438 | 0.648 |
| -1.212000000000218 | -0.361 | 0.437 | 0.642 |
| -1.208000000000218 | -0.361 | 0.436 | 0.636 |
| -1.204000000000218 | -0.361 | 0.435 | 0.63 |
| -1.200000000000218 | -0.361 | 0.434 | 0.625 |
| -1.196000000000218 | -0.362 | 0.433 | 0.619 |
| -1.192000000000218 | -0.362 | 0.431 | 0.613 |
| -1.188000000000218 | -0.362 | 0.43 | 0.607 |
| -1.184000000000218 | -0.362 | 0.429 | 0.601 |
| -1.180000000000218 | -0.363 | 0.428 | 0.596 |
| -1.176000000000218 | -0.363 | 0.427 | 0.59 |
| -1.172000000000218 | -0.363 | 0.425 | 0.584 |
| -1.168000000000218 | -0.363 | 0.424 | 0.579 |
| -1.164000000000218 | -0.363 | 0.423 | 0.573 |
| -1.160000000000218 | -0.364 | 0.422 | 0.568 |
| -1.156000000000218 | -0.364 | 0.421 | 0.562 |
| -1.152000000000218 | -0.364 | 0.419 | 0.557 |
| -1.148000000000218 | -0.364 | 0.418 | 0.551 |
| -1.144000000000218 | -0.364 | 0.417 | 0.546 |
| -1.140000000000218 | -0.365 | 0.416 | 0.54 |
| -1.136000000000218 | -0.365 | 0.414 | 0.535 |
| -1.132000000000218 | -0.365 | 0.413 | 0.529 |
| -1.128000000000218 | -0.365 | 0.412 | 0.524 |
| -1.124000000000218 | -0.365 | 0.411 | 0.519 |
| -1.120000000000218 | -0.365 | 0.409 | 0.513 |
| -1.116000000000218 | -0.366 | 0.408 | 0.508 |
| -1.112000000000218 | -0.366 | 0.407 | 0.503 |
| -1.108000000000218 | -0.366 | 0.405 | 0.498 |
| -1.104000000000218 | -0.366 | 0.404 | 0.493 |
| -1.100000000000218 | -0.366 | 0.403 | 0.487 |
| -1.096000000000218 | -0.366 | 0.401 | 0.482 |
| -1.092000000000218 | -0.366 | 0.4 | 0.477 |
| -1.088000000000218 | -0.367 | 0.399 | 0.472 |
| -1.084000000000218 | -0.367 | 0.397 | 0.467 |
| -1.080000000000218 | -0.367 | 0.396 | 0.462 |
| -1.076000000000218 | -0.367 | 0.395 | 0.457 |
| -1.072000000000218 | -0.367 | 0.393 | 0.452 |
| -1.068000000000218 | -0.367 | 0.392 | 0.447 |
| -1.064000000000218 | -0.367 | 0.391 | 0.442 |
| -1.060000000000218 | -0.367 | 0.389 | 0.437 |
| -1.056000000000218 | -0.367 | 0.388 | 0.433 |
| -1.052000000000218 | -0.367 | 0.387 | 0.428 |
| -1.048000000000218 | -0.367 | 0.385 | 0.423 |
| -1.044000000000218 | -0.368 | 0.384 | 0.418 |
| -1.040000000000218 | -0.368 | 0.382 | 0.413 |
| -1.036000000000218 | -0.368 | 0.381 | 0.409 |
| -1.032000000000218 | -0.368 | 0.379 | 0.404 |
| -1.028000000000218 | -0.368 | 0.378 | 0.4 |
| -1.024000000000218 | -0.368 | 0.377 | 0.395 |
| -1.020000000000218 | -0.368 | 0.375 | 0.39 |
| -1.016000000000218 | -0.368 | 0.374 | 0.386 |
| -1.012000000000218 | -0.368 | 0.372 | 0.381 |
| -1.008000000000218 | -0.368 | 0.371 | 0.377 |
| -1.004000000000218 | -0.368 | 0.369 | 0.372 |
| -1.000000000000218 | -0.368 | 0.368 | 0.368 |
| -0.996000000000218 | -0.368 | 0.366 | 0.363 |
| -0.992000000000218 | -0.368 | 0.365 | 0.359 |
| -0.988000000000218 | -0.368 | 0.363 | 0.355 |
| -0.984000000000218 | -0.368 | 0.362 | 0.35 |
| -0.980000000000218 | -0.368 | 0.36 | 0.346 |
| -0.976000000000218 | -0.368 | 0.359 | 0.342 |
| -0.972000000000218 | -0.368 | 0.357 | 0.338 |
| -0.968000000000218 | -0.368 | 0.356 | 0.334 |
| -0.964000000000218 | -0.368 | 0.354 | 0.329 |
| -0.960000000000218 | -0.368 | 0.353 | 0.325 |
| -0.956000000000218 | -0.368 | 0.351 | 0.321 |
| -0.952000000000218 | -0.367 | 0.35 | 0.317 |
| -0.948000000000218 | -0.367 | 0.348 | 0.313 |
| -0.944000000000218 | -0.367 | 0.347 | 0.309 |
| -0.940000000000218 | -0.367 | 0.345 | 0.305 |
| -0.936000000000218 | -0.367 | 0.344 | 0.301 |
| -0.932000000000218 | -0.367 | 0.342 | 0.297 |
| -0.928000000000218 | -0.367 | 0.34 | 0.293 |
| -0.924000000000218 | -0.367 | 0.339 | 0.289 |
| -0.920000000000218 | -0.367 | 0.337 | 0.285 |
| -0.916000000000218 | -0.367 | 0.336 | 0.282 |
| -0.912000000000218 | -0.366 | 0.334 | 0.278 |
| -0.908000000000217 | -0.366 | 0.333 | 0.274 |
| -0.904000000000217 | -0.366 | 0.331 | 0.27 |
| -0.900000000000217 | -0.366 | 0.329 | 0.267 |
| -0.896000000000217 | -0.366 | 0.328 | 0.263 |
| -0.892000000000217 | -0.366 | 0.326 | 0.259 |
| -0.888000000000217 | -0.365 | 0.324 | 0.256 |
| -0.884000000000217 | -0.365 | 0.323 | 0.252 |
| -0.880000000000217 | -0.365 | 0.321 | 0.249 |
| -0.876000000000217 | -0.365 | 0.32 | 0.245 |
| -0.872000000000217 | -0.365 | 0.318 | 0.242 |
| -0.868000000000217 | -0.364 | 0.316 | 0.238 |
| -0.864000000000217 | -0.364 | 0.315 | 0.235 |
| -0.860000000000217 | -0.364 | 0.313 | 0.231 |
| -0.856000000000217 | -0.364 | 0.311 | 0.228 |
| -0.852000000000217 | -0.363 | 0.31 | 0.225 |
| -0.848000000000217 | -0.363 | 0.308 | 0.221 |
| -0.844000000000217 | -0.363 | 0.306 | 0.218 |
| -0.840000000000217 | -0.363 | 0.305 | 0.215 |
| -0.836000000000217 | -0.362 | 0.303 | 0.212 |
| -0.832000000000217 | -0.362 | 0.301 | 0.209 |
| -0.828000000000217 | -0.362 | 0.3 | 0.205 |
| -0.824000000000217 | -0.361 | 0.298 | 0.202 |
| -0.820000000000217 | -0.361 | 0.296 | 0.199 |
| -0.816000000000217 | -0.361 | 0.294 | 0.196 |
| -0.812000000000217 | -0.361 | 0.293 | 0.193 |
| -0.808000000000217 | -0.36 | 0.291 | 0.19 |
| -0.804000000000217 | -0.36 | 0.289 | 0.187 |
| -0.800000000000217 | -0.359 | 0.288 | 0.184 |
| -0.796000000000217 | -0.359 | 0.286 | 0.181 |
| -0.792000000000217 | -0.359 | 0.284 | 0.178 |
| -0.788000000000217 | -0.358 | 0.282 | 0.175 |
| -0.784000000000217 | -0.358 | 0.281 | 0.172 |
| -0.780000000000217 | -0.358 | 0.279 | 0.17 |
| -0.776000000000217 | -0.357 | 0.277 | 0.167 |
| -0.772000000000217 | -0.357 | 0.275 | 0.164 |
| -0.768000000000217 | -0.356 | 0.274 | 0.161 |
| -0.764000000000217 | -0.356 | 0.272 | 0.159 |
| -0.760000000000217 | -0.355 | 0.27 | 0.156 |
| -0.756000000000217 | -0.355 | 0.268 | 0.153 |
| -0.752000000000217 | -0.355 | 0.267 | 0.151 |
| -0.748000000000217 | -0.354 | 0.265 | 0.148 |
| -0.744000000000217 | -0.354 | 0.263 | 0.146 |
| -0.740000000000217 | -0.353 | 0.261 | 0.143 |
| -0.736000000000217 | -0.353 | 0.259 | 0.141 |
| -0.732000000000217 | -0.352 | 0.258 | 0.138 |
| -0.728000000000217 | -0.352 | 0.256 | 0.136 |
| -0.724000000000217 | -0.351 | 0.254 | 0.133 |
| -0.720000000000217 | -0.35 | 0.252 | 0.131 |
| -0.716000000000217 | -0.35 | 0.251 | 0.128 |
| -0.712000000000217 | -0.349 | 0.249 | 0.126 |
| -0.708000000000217 | -0.349 | 0.247 | 0.124 |
| -0.704000000000217 | -0.348 | 0.245 | 0.121 |
| -0.700000000000217 | -0.348 | 0.243 | 0.119 |
| -0.696000000000217 | -0.347 | 0.242 | 0.117 |
| -0.692000000000217 | -0.346 | 0.24 | 0.115 |
| -0.688000000000217 | -0.346 | 0.238 | 0.113 |
| -0.684000000000217 | -0.345 | 0.236 | 0.11 |
| -0.680000000000217 | -0.344 | 0.234 | 0.108 |
| -0.676000000000217 | -0.344 | 0.232 | 0.106 |
| -0.672000000000217 | -0.343 | 0.231 | 0.104 |
| -0.668000000000217 | -0.343 | 0.229 | 0.102 |
| -0.664000000000217 | -0.342 | 0.227 | 0.1 |
| -0.660000000000217 | -0.341 | 0.225 | 0.098 |
| -0.656000000000217 | -0.34 | 0.223 | 0.096 |
| -0.652000000000217 | -0.34 | 0.221 | 0.094 |
| -0.648000000000217 | -0.339 | 0.22 | 0.092 |
| -0.644000000000217 | -0.338 | 0.218 | 0.09 |
| -0.640000000000217 | -0.337 | 0.216 | 0.088 |
| -0.636000000000217 | -0.337 | 0.214 | 0.087 |
| -0.632000000000217 | -0.336 | 0.212 | 0.085 |
| -0.628000000000217 | -0.335 | 0.21 | 0.083 |
| -0.624000000000217 | -0.334 | 0.209 | 0.081 |
| -0.620000000000217 | -0.334 | 0.207 | 0.079 |
| -0.616000000000217 | -0.333 | 0.205 | 0.078 |
| -0.612000000000217 | -0.332 | 0.203 | 0.076 |
| -0.608000000000217 | -0.331 | 0.201 | 0.074 |
| -0.604000000000217 | -0.33 | 0.199 | 0.073 |
| -0.600000000000217 | -0.329 | 0.198 | 0.071 |
| -0.596000000000217 | -0.328 | 0.196 | 0.07 |
| -0.592000000000217 | -0.328 | 0.194 | 0.068 |
| -0.588000000000217 | -0.327 | 0.192 | 0.066 |
| -0.584000000000217 | -0.326 | 0.19 | 0.065 |
| -0.580000000000217 | -0.325 | 0.188 | 0.063 |
| -0.576000000000217 | -0.324 | 0.187 | 0.062 |
| -0.572000000000217 | -0.323 | 0.185 | 0.06 |
| -0.568000000000217 | -0.322 | 0.183 | 0.059 |
| -0.564000000000217 | -0.321 | 0.181 | 0.058 |
| -0.560000000000217 | -0.32 | 0.179 | 0.056 |
| -0.556000000000217 | -0.319 | 0.177 | 0.055 |
| -0.552000000000217 | -0.318 | 0.175 | 0.053 |
| -0.548000000000217 | -0.317 | 0.174 | 0.052 |
| -0.544000000000217 | -0.316 | 0.172 | 0.051 |
| -0.540000000000217 | -0.315 | 0.17 | 0.05 |
| -0.536000000000217 | -0.314 | 0.168 | 0.048 |
| -0.532000000000217 | -0.313 | 0.166 | 0.047 |
| -0.528000000000217 | -0.311 | 0.164 | 0.046 |
| -0.524000000000217 | -0.31 | 0.163 | 0.045 |
| -0.520000000000217 | -0.309 | 0.161 | 0.043 |
| -0.516000000000217 | -0.308 | 0.159 | 0.042 |
| -0.512000000000217 | -0.307 | 0.157 | 0.041 |
| -0.508000000000217 | -0.306 | 0.155 | 0.04 |
| -0.504000000000217 | -0.304 | 0.153 | 0.039 |
| -0.500000000000217 | -0.303 | 0.152 | 0.038 |
| -0.496000000000217 | -0.302 | 0.15 | 0.037 |
| -0.492000000000217 | -0.301 | 0.148 | 0.036 |
| -0.488000000000217 | -0.3 | 0.146 | 0.035 |
| -0.484000000000217 | -0.298 | 0.144 | 0.034 |
| -0.480000000000217 | -0.297 | 0.143 | 0.033 |
| -0.476000000000217 | -0.296 | 0.141 | 0.032 |
| -0.472000000000217 | -0.294 | 0.139 | 0.031 |
| -0.468000000000217 | -0.293 | 0.137 | 0.03 |
| -0.464000000000217 | -0.292 | 0.135 | 0.029 |
| -0.460000000000217 | -0.29 | 0.134 | 0.028 |
| -0.456000000000217 | -0.289 | 0.132 | 0.027 |
| -0.452000000000217 | -0.288 | 0.13 | 0.027 |
| -0.448000000000217 | -0.286 | 0.128 | 0.026 |
| -0.444000000000217 | -0.285 | 0.126 | 0.025 |
| -0.440000000000217 | -0.283 | 0.125 | 0.024 |
| -0.436000000000217 | -0.282 | 0.123 | 0.023 |
| -0.432000000000217 | -0.28 | 0.121 | 0.023 |
| -0.428000000000217 | -0.279 | 0.119 | 0.022 |
| -0.424000000000217 | -0.277 | 0.118 | 0.021 |
| -0.420000000000217 | -0.276 | 0.116 | 0.02 |
| -0.416000000000217 | -0.274 | 0.114 | 0.02 |
| -0.412000000000217 | -0.273 | 0.112 | 0.019 |
| -0.408000000000217 | -0.271 | 0.111 | 0.018 |
| -0.404000000000217 | -0.27 | 0.109 | 0.018 |
| -0.400000000000217 | -0.268 | 0.107 | 0.017 |
| -0.396000000000217 | -0.267 | 0.106 | 0.017 |
| -0.392000000000217 | -0.265 | 0.104 | 0.016 |
| -0.388000000000217 | -0.263 | 0.102 | 0.015 |
| -0.384000000000217 | -0.262 | 0.1 | 0.015 |
| -0.380000000000217 | -0.26 | 0.099 | 0.014 |
| -0.376000000000217 | -0.258 | 0.097 | 0.014 |
| -0.372000000000217 | -0.256 | 0.095 | 0.013 |
| -0.368000000000217 | -0.255 | 0.094 | 0.013 |
| -0.364000000000217 | -0.253 | 0.092 | 0.012 |
| -0.360000000000217 | -0.251 | 0.09 | 0.012 |
| -0.356000000000217 | -0.249 | 0.089 | 0.011 |
| -0.352000000000217 | -0.248 | 0.087 | 0.011 |
| -0.348000000000217 | -0.246 | 0.086 | 0.01 |
| -0.344000000000217 | -0.244 | 0.084 | 0.01 |
| -0.340000000000217 | -0.242 | 0.082 | 0.01 |
| -0.336000000000217 | -0.24 | 0.081 | 0.009 |
| -0.332000000000217 | -0.238 | 0.079 | 0.009 |
| -0.328000000000217 | -0.236 | 0.077 | 0.008 |
| -0.324000000000217 | -0.234 | 0.076 | 0.008 |
| -0.320000000000217 | -0.232 | 0.074 | 0.008 |
| -0.316000000000217 | -0.23 | 0.073 | 0.007 |
| -0.312000000000217 | -0.228 | 0.071 | 0.007 |
| -0.308000000000217 | -0.226 | 0.07 | 0.007 |
| -0.304000000000217 | -0.224 | 0.068 | 0.006 |
| -0.300000000000217 | -0.222 | 0.067 | 0.006 |
| -0.296000000000217 | -0.22 | 0.065 | 0.006 |
| -0.292000000000217 | -0.218 | 0.064 | 0.005 |
| -0.288000000000217 | -0.216 | 0.062 | 0.005 |
| -0.284000000000217 | -0.214 | 0.061 | 0.005 |
| -0.280000000000217 | -0.212 | 0.059 | 0.005 |
| -0.276000000000217 | -0.209 | 0.058 | 0.004 |
| -0.272000000000217 | -0.207 | 0.056 | 0.004 |
| -0.268000000000217 | -0.205 | 0.055 | 0.004 |
| -0.264000000000217 | -0.203 | 0.054 | 0.004 |
| -0.260000000000217 | -0.2 | 0.052 | 0.004 |
| -0.256000000000217 | -0.198 | 0.051 | 0.003 |
| -0.252000000000217 | -0.196 | 0.049 | 0.003 |
| -0.248000000000217 | -0.194 | 0.048 | 0.003 |
| -0.244000000000217 | -0.191 | 0.047 | 0.003 |
| -0.240000000000217 | -0.189 | 0.045 | 0.003 |
| -0.236000000000217 | -0.186 | 0.044 | 0.002 |
| -0.232000000000217 | -0.184 | 0.043 | 0.002 |
| -0.228000000000217 | -0.182 | 0.041 | 0.002 |
| -0.224000000000217 | -0.179 | 0.04 | 0.002 |
| -0.220000000000217 | -0.177 | 0.039 | 0.002 |
| -0.216000000000217 | -0.174 | 0.038 | 0.002 |
| -0.212000000000217 | -0.172 | 0.036 | 0.002 |
| -0.208000000000217 | -0.169 | 0.035 | 0.002 |
| -0.204000000000217 | -0.166 | 0.034 | 0.001 |
| -0.200000000000217 | -0.164 | 0.033 | 0.001 |
| -0.196000000000217 | -0.161 | 0.032 | 0.001 |
| -0.192000000000217 | -0.158 | 0.03 | 0.001 |
| -0.188000000000217 | -0.156 | 0.029 | 0.001 |
| -0.184000000000217 | -0.153 | 0.028 | 0.001 |
| -0.180000000000217 | -0.15 | 0.027 | 0.001 |
| -0.176000000000217 | -0.148 | 0.026 | 0.001 |
| -0.172000000000217 | -0.145 | 0.025 | 0.001 |
| -0.168000000000217 | -0.142 | 0.024 | 0.001 |
| -0.164000000000217 | -0.139 | 0.023 | 0.001 |
| -0.160000000000217 | -0.136 | 0.022 | 0.001 |
| -0.156000000000217 | -0.133 | 0.021 | 0.001 |
| -0.152000000000217 | -0.131 | 0.02 | 0 |
| -0.148000000000217 | -0.128 | 0.019 | 0 |
| -0.144000000000217 | -0.125 | 0.018 | 0 |
| -0.140000000000217 | -0.122 | 0.017 | 0 |
| -0.136000000000217 | -0.119 | 0.016 | 0 |
| -0.132000000000217 | -0.116 | 0.015 | 0 |
| -0.128000000000217 | -0.113 | 0.014 | 0 |
| -0.124000000000217 | -0.11 | 0.014 | 0 |
| -0.120000000000217 | -0.106 | 0.013 | 0 |
| -0.116000000000217 | -0.103 | 0.012 | 0 |
| -0.112000000000217 | -0.1 | 0.011 | 0 |
| -0.108000000000217 | -0.097 | 0.01 | 0 |
| -0.104000000000217 | -0.094 | 0.01 | 0 |
| -0.100000000000217 | -0.09 | 0.009 | 0 |
| -0.0960000000002168 | -0.087 | 0.008 | 0 |
| -0.0920000000002168 | -0.084 | 0.008 | 0 |
| -0.0880000000002168 | -0.081 | 0.007 | 0 |
| -0.0840000000002168 | -0.077 | 0.006 | 0 |
| -0.0800000000002168 | -0.074 | 0.006 | 0 |
| -0.0760000000002168 | -0.07 | 0.005 | 0 |
| -0.0720000000002168 | -0.067 | 0.005 | 0 |
| -0.0680000000002168 | -0.064 | 0.004 | 0 |
| -0.0640000000002168 | -0.06 | 0.004 | 0 |
| -0.0600000000002168 | -0.057 | 0.003 | 0 |
| -0.0560000000002168 | -0.053 | 0.003 | 0 |
| -0.0520000000002168 | -0.049 | 0.003 | 0 |
| -0.0480000000002167 | -0.046 | 0.002 | 0 |
| -0.0440000000002167 | -0.042 | 0.002 | 0 |
| -0.0400000000002167 | -0.038 | 0.002 | 0 |
| -0.0360000000002167 | -0.035 | 0.001 | 0 |
| -0.0320000000002167 | -0.031 | 0.001 | 0 |
| -0.0280000000002167 | -0.027 | 0.001 | 0 |
| -0.0240000000002167 | -0.023 | 0.001 | 0 |
| -0.0200000000002167 | -0.02 | 0 | 0 |
| -0.0160000000002167 | -0.016 | 0 | 0 |
| -0.0120000000002167 | -0.012 | 0 | 0 |
| -0.00800000000021674 | -0.008 | 0 | 0 |
| -0.00400000000021674 | -0.004 | 0 | 0 |
| -2.16743289982446e-13 | 0 | 0 | 0 |
| 0.00399999999978326 | 0.004 | 0 | 0 |
| 0.00799999999978325 | 0.008 | 0 | 0 |
| 0.0119999999997833 | 0.012 | 0 | 0 |
| 0.0159999999997833 | 0.016 | 0 | 0 |
| 0.0199999999997833 | 0.02 | 0 | 0 |
| 0.0239999999997833 | 0.025 | 0.001 | 0 |
| 0.0279999999997833 | 0.029 | 0.001 | 0 |
| 0.0319999999997833 | 0.033 | 0.001 | 0 |
| 0.0359999999997833 | 0.037 | 0.001 | 0 |
| 0.0399999999997833 | 0.042 | 0.002 | 0 |
| 0.0439999999997833 | 0.046 | 0.002 | 0 |
| 0.0479999999997833 | 0.05 | 0.002 | 0 |
| 0.0519999999997833 | 0.055 | 0.003 | 0 |
| 0.0559999999997833 | 0.059 | 0.003 | 0 |
| 0.0599999999997833 | 0.064 | 0.004 | 0 |
| 0.0639999999997833 | 0.068 | 0.004 | 0 |
| 0.0679999999997833 | 0.073 | 0.005 | 0 |
| 0.0719999999997833 | 0.077 | 0.006 | 0 |
| 0.0759999999997833 | 0.082 | 0.006 | 0 |
| 0.0799999999997833 | 0.087 | 0.007 | 0 |
| 0.0839999999997833 | 0.091 | 0.008 | 0 |
| 0.0879999999997833 | 0.096 | 0.008 | 0 |
| 0.0919999999997833 | 0.101 | 0.009 | 0 |
| 0.0959999999997833 | 0.106 | 0.01 | 0 |
| 0.0999999999997833 | 0.111 | 0.011 | 0 |
| 0.103999999999783 | 0.115 | 0.012 | 0 |
| 0.107999999999783 | 0.12 | 0.013 | 0 |
| 0.111999999999783 | 0.125 | 0.014 | 0 |
| 0.115999999999783 | 0.13 | 0.015 | 0 |
| 0.119999999999783 | 0.135 | 0.016 | 0 |
| 0.123999999999783 | 0.14 | 0.017 | 0 |
| 0.127999999999783 | 0.145 | 0.019 | 0 |
| 0.131999999999783 | 0.151 | 0.02 | 0 |
| 0.135999999999783 | 0.156 | 0.021 | 0 |
| 0.139999999999783 | 0.161 | 0.023 | 0 |
| 0.143999999999783 | 0.166 | 0.024 | 0 |
| 0.147999999999783 | 0.172 | 0.025 | 0.001 |
| 0.151999999999783 | 0.177 | 0.027 | 0.001 |
| 0.155999999999783 | 0.182 | 0.028 | 0.001 |
| 0.159999999999783 | 0.188 | 0.03 | 0.001 |
| 0.163999999999783 | 0.193 | 0.032 | 0.001 |
| 0.167999999999783 | 0.199 | 0.033 | 0.001 |
| 0.171999999999783 | 0.204 | 0.035 | 0.001 |
| 0.175999999999783 | 0.21 | 0.037 | 0.001 |
| 0.179999999999783 | 0.215 | 0.039 | 0.001 |
| 0.183999999999783 | 0.221 | 0.041 | 0.001 |
| 0.187999999999783 | 0.227 | 0.043 | 0.002 |
| 0.191999999999783 | 0.233 | 0.045 | 0.002 |
| 0.195999999999783 | 0.238 | 0.047 | 0.002 |
| 0.199999999999783 | 0.244 | 0.049 | 0.002 |
| 0.203999999999783 | 0.25 | 0.051 | 0.002 |
| 0.207999999999783 | 0.256 | 0.053 | 0.002 |
| 0.211999999999783 | 0.262 | 0.056 | 0.002 |
| 0.215999999999783 | 0.268 | 0.058 | 0.003 |
| 0.219999999999783 | 0.274 | 0.06 | 0.003 |
| 0.223999999999783 | 0.28 | 0.063 | 0.003 |
| 0.227999999999783 | 0.286 | 0.065 | 0.003 |
| 0.231999999999783 | 0.293 | 0.068 | 0.004 |
| 0.235999999999783 | 0.299 | 0.071 | 0.004 |
| 0.239999999999783 | 0.305 | 0.073 | 0.004 |
| 0.243999999999783 | 0.311 | 0.076 | 0.005 |
| 0.247999999999783 | 0.318 | 0.079 | 0.005 |
| 0.251999999999783 | 0.324 | 0.082 | 0.005 |
| 0.255999999999783 | 0.331 | 0.085 | 0.006 |
| 0.259999999999783 | 0.337 | 0.088 | 0.006 |
| 0.263999999999783 | 0.344 | 0.091 | 0.006 |
| 0.267999999999783 | 0.35 | 0.094 | 0.007 |
| 0.271999999999783 | 0.357 | 0.097 | 0.007 |
| 0.275999999999783 | 0.364 | 0.1 | 0.008 |
| 0.279999999999783 | 0.37 | 0.104 | 0.008 |
| 0.283999999999783 | 0.377 | 0.107 | 0.009 |
| 0.287999999999783 | 0.384 | 0.111 | 0.009 |
| 0.291999999999783 | 0.391 | 0.114 | 0.01 |
| 0.295999999999783 | 0.398 | 0.118 | 0.01 |
| 0.299999999999783 | 0.405 | 0.121 | 0.011 |
| 0.303999999999783 | 0.412 | 0.125 | 0.012 |
| 0.307999999999783 | 0.419 | 0.129 | 0.012 |
| 0.311999999999783 | 0.426 | 0.133 | 0.013 |
| 0.315999999999783 | 0.433 | 0.137 | 0.014 |
| 0.319999999999783 | 0.441 | 0.141 | 0.014 |
| 0.323999999999783 | 0.448 | 0.145 | 0.015 |
| 0.327999999999783 | 0.455 | 0.149 | 0.016 |
| 0.331999999999783 | 0.463 | 0.154 | 0.017 |
| 0.335999999999783 | 0.47 | 0.158 | 0.018 |
| 0.339999999999783 | 0.478 | 0.162 | 0.019 |
| 0.343999999999783 | 0.485 | 0.167 | 0.02 |
| 0.347999999999783 | 0.493 | 0.172 | 0.021 |
| 0.351999999999783 | 0.501 | 0.176 | 0.022 |
| 0.355999999999783 | 0.508 | 0.181 | 0.023 |
| 0.359999999999783 | 0.516 | 0.186 | 0.024 |
| 0.363999999999783 | 0.524 | 0.191 | 0.025 |
| 0.367999999999783 | 0.532 | 0.196 | 0.026 |
| 0.371999999999784 | 0.54 | 0.201 | 0.028 |
| 0.375999999999784 | 0.548 | 0.206 | 0.029 |
| 0.379999999999784 | 0.556 | 0.211 | 0.03 |
| 0.383999999999784 | 0.564 | 0.216 | 0.032 |
| 0.387999999999784 | 0.572 | 0.222 | 0.033 |
| 0.391999999999784 | 0.58 | 0.227 | 0.035 |
| 0.395999999999784 | 0.588 | 0.233 | 0.037 |
| 0.399999999999784 | 0.597 | 0.239 | 0.038 |
| 0.403999999999784 | 0.605 | 0.244 | 0.04 |
| 0.407999999999784 | 0.614 | 0.25 | 0.042 |
| 0.411999999999784 | 0.622 | 0.256 | 0.044 |
| 0.415999999999784 | 0.631 | 0.262 | 0.045 |
| 0.419999999999784 | 0.639 | 0.268 | 0.047 |
| 0.423999999999784 | 0.648 | 0.275 | 0.049 |
| 0.427999999999784 | 0.657 | 0.281 | 0.051 |
| 0.431999999999784 | 0.665 | 0.287 | 0.054 |
| 0.435999999999784 | 0.674 | 0.294 | 0.056 |
| 0.439999999999784 | 0.683 | 0.301 | 0.058 |
| 0.443999999999784 | 0.692 | 0.307 | 0.061 |
| 0.447999999999784 | 0.701 | 0.314 | 0.063 |
| 0.451999999999784 | 0.71 | 0.321 | 0.066 |
| 0.455999999999784 | 0.719 | 0.328 | 0.068 |
| 0.459999999999784 | 0.729 | 0.335 | 0.071 |
| 0.463999999999784 | 0.738 | 0.342 | 0.074 |
| 0.467999999999784 | 0.747 | 0.35 | 0.077 |
| 0.471999999999784 | 0.757 | 0.357 | 0.08 |
| 0.475999999999784 | 0.766 | 0.365 | 0.083 |
| 0.479999999999784 | 0.776 | 0.372 | 0.086 |
| 0.483999999999784 | 0.785 | 0.38 | 0.089 |
| 0.487999999999784 | 0.795 | 0.388 | 0.092 |
| 0.491999999999784 | 0.805 | 0.396 | 0.096 |
| 0.495999999999784 | 0.815 | 0.404 | 0.099 |
| 0.499999999999784 | 0.824 | 0.412 | 0.103 |
| 0.503999999999784 | 0.834 | 0.42 | 0.107 |
| 0.507999999999784 | 0.844 | 0.429 | 0.111 |
| 0.511999999999784 | 0.854 | 0.437 | 0.115 |
| 0.515999999999784 | 0.864 | 0.446 | 0.119 |
| 0.519999999999784 | 0.875 | 0.455 | 0.123 |
| 0.523999999999784 | 0.885 | 0.464 | 0.127 |
| 0.527999999999784 | 0.895 | 0.473 | 0.132 |
| 0.531999999999784 | 0.906 | 0.482 | 0.136 |
| 0.535999999999784 | 0.916 | 0.491 | 0.141 |
| 0.539999999999784 | 0.927 | 0.5 | 0.146 |
| 0.543999999999784 | 0.937 | 0.51 | 0.151 |
| 0.547999999999784 | 0.948 | 0.519 | 0.156 |
| 0.551999999999784 | 0.959 | 0.529 | 0.161 |
| 0.555999999999784 | 0.969 | 0.539 | 0.167 |
| 0.559999999999784 | 0.98 | 0.549 | 0.172 |
| 0.563999999999784 | 0.991 | 0.559 | 0.178 |
| 0.567999999999784 | 1.002 | 0.569 | 0.184 |
| 0.571999999999784 | 1.013 | 0.58 | 0.19 |
| 0.575999999999784 | 1.025 | 0.59 | 0.196 |
| 0.579999999999784 | 1.036 | 0.601 | 0.202 |
| 0.583999999999784 | 1.047 | 0.612 | 0.209 |
| 0.587999999999784 | 1.059 | 0.622 | 0.215 |
| 0.591999999999784 | 1.07 | 0.633 | 0.222 |
| 0.595999999999784 | 1.082 | 0.645 | 0.229 |
| 0.599999999999784 | 1.093 | 0.656 | 0.236 |
| 0.603999999999784 | 1.105 | 0.667 | 0.243 |
| 0.607999999999784 | 1.117 | 0.679 | 0.251 |
| 0.611999999999784 | 1.129 | 0.691 | 0.259 |
| 0.615999999999784 | 1.141 | 0.703 | 0.267 |
| 0.619999999999784 | 1.153 | 0.715 | 0.275 |
| 0.623999999999784 | 1.165 | 0.727 | 0.283 |
| 0.627999999999784 | 1.177 | 0.739 | 0.291 |
| 0.631999999999784 | 1.189 | 0.751 | 0.3 |
| 0.635999999999784 | 1.201 | 0.764 | 0.309 |
| 0.639999999999784 | 1.214 | 0.777 | 0.318 |
| 0.643999999999784 | 1.226 | 0.79 | 0.328 |
| 0.647999999999784 | 1.239 | 0.803 | 0.337 |
| 0.651999999999784 | 1.251 | 0.816 | 0.347 |
| 0.655999999999784 | 1.264 | 0.829 | 0.357 |
| 0.659999999999784 | 1.277 | 0.843 | 0.367 |
| 0.663999999999784 | 1.29 | 0.856 | 0.378 |
| 0.667999999999784 | 1.303 | 0.87 | 0.388 |
| 0.671999999999784 | 1.316 | 0.884 | 0.399 |
| 0.675999999999784 | 1.329 | 0.898 | 0.411 |
| 0.679999999999784 | 1.342 | 0.913 | 0.422 |
| 0.683999999999784 | 1.356 | 0.927 | 0.434 |
| 0.687999999999784 | 1.369 | 0.942 | 0.446 |
| 0.691999999999784 | 1.382 | 0.957 | 0.458 |
| 0.695999999999784 | 1.396 | 0.972 | 0.471 |
| 0.699999999999784 | 1.41 | 0.987 | 0.484 |
| 0.703999999999784 | 1.423 | 1.002 | 0.497 |
| 0.707999999999784 | 1.437 | 1.018 | 0.51 |
| 0.711999999999784 | 1.451 | 1.033 | 0.524 |
| 0.715999999999784 | 1.465 | 1.049 | 0.538 |
| 0.719999999999784 | 1.479 | 1.065 | 0.552 |
| 0.723999999999784 | 1.493 | 1.081 | 0.567 |
| 0.727999999999784 | 1.508 | 1.098 | 0.582 |
| 0.731999999999784 | 1.522 | 1.114 | 0.597 |
| 0.735999999999784 | 1.536 | 1.131 | 0.613 |
| 0.739999999999784 | 1.551 | 1.148 | 0.628 |
| 0.743999999999784 | 1.566 | 1.165 | 0.645 |
| 0.747999999999784 | 1.58 | 1.182 | 0.661 |
| 0.751999999999784 | 1.595 | 1.2 | 0.678 |
| 0.755999999999784 | 1.61 | 1.217 | 0.696 |
| 0.759999999999784 | 1.625 | 1.235 | 0.713 |
| 0.763999999999784 | 1.64 | 1.253 | 0.731 |
| 0.767999999999784 | 1.655 | 1.271 | 0.75 |
| 0.771999999999784 | 1.671 | 1.29 | 0.769 |
| 0.775999999999784 | 1.686 | 1.308 | 0.788 |
| 0.779999999999784 | 1.702 | 1.327 | 0.807 |
| 0.783999999999784 | 1.717 | 1.346 | 0.827 |
| 0.787999999999784 | 1.733 | 1.365 | 0.848 |
| 0.791999999999784 | 1.749 | 1.385 | 0.869 |
| 0.795999999999784 | 1.764 | 1.405 | 0.89 |
| 0.799999999999784 | 1.78 | 1.424 | 0.912 |
| 0.803999999999784 | 1.797 | 1.444 | 0.934 |
| 0.807999999999784 | 1.813 | 1.465 | 0.956 |
| 0.811999999999784 | 1.829 | 1.485 | 0.979 |
| 0.815999999999784 | 1.845 | 1.506 | 1.003 |
| 0.819999999999784 | 1.862 | 1.527 | 1.027 |
| 0.823999999999784 | 1.878 | 1.548 | 1.051 |
| 0.827999999999784 | 1.895 | 1.569 | 1.076 |
| 0.831999999999784 | 1.912 | 1.591 | 1.101 |
| 0.835999999999784 | 1.929 | 1.612 | 1.127 |
| 0.839999999999784 | 1.946 | 1.634 | 1.153 |
| 0.843999999999784 | 1.963 | 1.657 | 1.18 |
| 0.847999999999784 | 1.98 | 1.679 | 1.207 |
| 0.851999999999784 | 1.997 | 1.702 | 1.235 |
| 0.855999999999784 | 2.015 | 1.725 | 1.264 |
| 0.859999999999784 | 2.032 | 1.748 | 1.293 |
| 0.863999999999784 | 2.05 | 1.771 | 1.322 |
| 0.867999999999784 | 2.068 | 1.795 | 1.352 |
| 0.871999999999784 | 2.086 | 1.819 | 1.383 |
| 0.875999999999784 | 2.104 | 1.843 | 1.414 |
| 0.879999999999784 | 2.122 | 1.867 | 1.446 |
| 0.883999999999784 | 2.14 | 1.892 | 1.478 |
| 0.887999999999784 | 2.158 | 1.916 | 1.511 |
| 0.891999999999784 | 2.176 | 1.941 | 1.545 |
| 0.895999999999784 | 2.195 | 1.967 | 1.579 |
| 0.899999999999784 | 2.214 | 1.992 | 1.614 |
| 0.903999999999784 | 2.232 | 2.018 | 1.649 |
| 0.907999999999784 | 2.251 | 2.044 | 1.685 |
| 0.911999999999784 | 2.27 | 2.07 | 1.722 |
| 0.915999999999784 | 2.289 | 2.097 | 1.76 |
| 0.919999999999784 | 2.309 | 2.124 | 1.798 |
| 0.923999999999784 | 2.328 | 2.151 | 1.836 |
| 0.927999999999784 | 2.347 | 2.178 | 1.876 |
| 0.931999999999784 | 2.367 | 2.206 | 1.916 |
| 0.935999999999784 | 2.387 | 2.234 | 1.957 |
| 0.939999999999784 | 2.406 | 2.262 | 1.999 |
| 0.943999999999784 | 2.426 | 2.29 | 2.041 |
| 0.947999999999784 | 2.446 | 2.319 | 2.084 |
| 0.951999999999784 | 2.467 | 2.348 | 2.128 |
| 0.955999999999784 | 2.487 | 2.377 | 2.173 |
| 0.959999999999784 | 2.507 | 2.407 | 2.218 |
| 0.963999999999784 | 2.528 | 2.437 | 2.264 |
| 0.967999999999784 | 2.548 | 2.467 | 2.312 |
| 0.971999999999784 | 2.569 | 2.497 | 2.359 |
| 0.975999999999784 | 2.59 | 2.528 | 2.408 |
| 0.979999999999784 | 2.611 | 2.559 | 2.458 |
| 0.983999999999784 | 2.632 | 2.59 | 2.508 |
| 0.987999999999784 | 2.654 | 2.622 | 2.559 |
| 0.991999999999784 | 2.675 | 2.654 | 2.611 |
| 0.995999999999784 | 2.697 | 2.686 | 2.664 |
| 0.999999999999784 | 2.718 | 2.718 | 2.718 |
| 1.003999999999784 | 2.74 | 2.751 | 2.773 |
| 1.007999999999784 | 2.762 | 2.784 | 2.829 |
| 1.011999999999784 | 2.784 | 2.818 | 2.886 |
| 1.015999999999784 | 2.806 | 2.851 | 2.943 |
| 1.019999999999784 | 2.829 | 2.885 | 3.002 |
| 1.023999999999784 | 2.851 | 2.92 | 3.061 |
| 1.027999999999784 | 2.874 | 2.954 | 3.122 |
| 1.031999999999784 | 2.896 | 2.989 | 3.184 |
| 1.035999999999784 | 2.919 | 3.024 | 3.246 |
| 1.039999999999784 | 2.942 | 3.06 | 3.31 |
| 1.043999999999784 | 2.966 | 3.096 | 3.374 |
| 1.047999999999784 | 2.989 | 3.132 | 3.44 |
| 1.051999999999784 | 3.012 | 3.169 | 3.507 |
| 1.055999999999784 | 3.036 | 3.206 | 3.575 |
| 1.059999999999784 | 3.06 | 3.243 | 3.644 |
| 1.063999999999784 | 3.083 | 3.281 | 3.714 |
| 1.067999999999784 | 3.107 | 3.319 | 3.785 |
| 1.071999999999784 | 3.132 | 3.357 | 3.858 |
| 1.075999999999784 | 3.156 | 3.396 | 3.931 |
| 1.079999999999784 | 3.18 | 3.435 | 4.006 |
| 1.083999999999784 | 3.205 | 3.474 | 4.082 |
| 1.087999999999784 | 3.23 | 3.514 | 4.159 |
| 1.091999999999784 | 3.254 | 3.554 | 4.238 |
| 1.095999999999784 | 3.279 | 3.594 | 4.317 |
| 1.099999999999784 | 3.305 | 3.635 | 4.398 |
| 1.103999999999784 | 3.33 | 3.676 | 4.481 |
| 1.107999999999784 | 3.355 | 3.718 | 4.564 |
| 1.111999999999784 | 3.381 | 3.76 | 4.649 |
| 1.115999999999784 | 3.407 | 3.802 | 4.735 |
| 1.119999999999784 | 3.433 | 3.845 | 4.823 |
| 1.123999999999784 | 3.459 | 3.888 | 4.911 |
| 1.127999999999784 | 3.485 | 3.931 | 5.002 |
| 1.131999999999784 | 3.511 | 3.975 | 5.093 |
| 1.135999999999784 | 3.538 | 4.019 | 5.186 |
| 1.139999999999784 | 3.565 | 4.064 | 5.281 |
| 1.143999999999784 | 3.591 | 4.109 | 5.377 |
| 1.147999999999784 | 3.618 | 4.154 | 5.474 |
| 1.151999999999784 | 3.646 | 4.2 | 5.573 |
| 1.155999999999784 | 3.673 | 4.246 | 5.674 |
| 1.159999999999784 | 3.7 | 4.292 | 5.776 |
| 1.163999999999784 | 3.728 | 4.339 | 5.879 |
| 1.167999999999784 | 3.756 | 4.387 | 5.984 |
| 1.171999999999784 | 3.784 | 4.435 | 6.091 |
| 1.175999999999784 | 3.812 | 4.483 | 6.2 |
| 1.179999999999784 | 3.84 | 4.531 | 6.31 |
| 1.183999999999784 | 3.869 | 4.58 | 6.421 |
| 1.187999999999784 | 3.897 | 4.63 | 6.534 |
| 1.191999999999784 | 3.926 | 4.68 | 6.649 |
| 1.195999999999784 | 3.955 | 4.73 | 6.766 |
| 1.199999999999784 | 3.984 | 4.781 | 6.885 |
| 1.203999999999784 | 4.013 | 4.832 | 7.005 |
| 1.207999999999784 | 4.043 | 4.884 | 7.127 |
| 1.211999999999784 | 4.073 | 4.936 | 7.251 |
| 1.215999999999784 | 4.102 | 4.988 | 7.376 |
| 1.219999999999784 | 4.132 | 5.041 | 7.504 |
| 1.223999999999784 | 4.163 | 5.095 | 7.633 |
| 1.227999999999784 | 4.193 | 5.149 | 7.764 |
| 1.231999999999784 | 4.223 | 5.203 | 7.898 |
| 1.235999999999784 | 4.254 | 5.258 | 8.033 |
| 1.239999999999784 | 4.285 | 5.313 | 8.17 |
| 1.243999999999784 | 4.316 | 5.369 | 8.309 |
| 1.247999999999784 | 4.347 | 5.425 | 8.45 |
| 1.251999999999784 | 4.379 | 5.482 | 8.593 |
| 1.255999999999784 | 4.41 | 5.539 | 8.738 |
| 1.259999999999784 | 4.442 | 5.597 | 8.886 |
| 1.263999999999784 | 4.474 | 5.655 | 9.035 |
| 1.267999999999784 | 4.506 | 5.714 | 9.187 |
| 1.271999999999784 | 4.538 | 5.773 | 9.341 |
| 1.275999999999784 | 4.571 | 5.833 | 9.496 |
| 1.279999999999784 | 4.604 | 5.893 | 9.655 |
| 1.283999999999784 | 4.637 | 5.953 | 9.815 |
| 1.287999999999784 | 4.67 | 6.015 | 9.978 |
| 1.291999999999784 | 4.703 | 6.076 | 10.143 |
| 1.295999999999784 | 4.736 | 6.138 | 10.31 |
| 1.299999999999784 | 4.77 | 6.201 | 10.48 |
| 1.303999999999784 | 4.804 | 6.264 | 10.652 |
| 1.307999999999784 | 4.838 | 6.328 | 10.827 |
| 1.311999999999784 | 4.872 | 6.392 | 11.003 |
| 1.315999999999784 | 4.907 | 6.457 | 11.183 |
| 1.319999999999784 | 4.941 | 6.523 | 11.365 |
| 1.323999999999784 | 4.976 | 6.588 | 11.549 |
| 1.327999999999784 | 5.011 | 6.655 | 11.736 |
| 1.331999999999784 | 5.046 | 6.722 | 11.926 |
| 1.335999999999784 | 5.082 | 6.789 | 12.118 |
| 1.339999999999784 | 5.118 | 6.857 | 12.313 |
| 1.343999999999784 | 5.153 | 6.926 | 12.511 |
| 1.347999999999784 | 5.189 | 6.995 | 12.711 |
| 1.351999999999784 | 5.226 | 7.065 | 12.914 |
| 1.355999999999784 | 5.262 | 7.135 | 13.12 |
| 1.359999999999784 | 5.299 | 7.206 | 13.329 |
| 1.363999999999784 | 5.336 | 7.278 | 13.541 |
| 1.367999999999784 | 5.373 | 7.35 | 13.755 |
| 1.371999999999784 | 5.41 | 7.423 | 13.972 |
| 1.375999999999784 | 5.448 | 7.496 | 14.193 |
| 1.379999999999784 | 5.485 | 7.57 | 14.416 |
| 1.383999999999784 | 5.523 | 7.644 | 14.642 |
| 1.387999999999784 | 5.561 | 7.719 | 14.872 |
| 1.391999999999784 | 5.6 | 7.795 | 15.104 |
| 1.395999999999784 | 5.638 | 7.871 | 15.34 |
| 1.399999999999784 | 5.677 | 7.948 | 15.578 |
| 1.403999999999784 | 5.716 | 8.026 | 15.82 |
| 1.407999999999784 | 5.756 | 8.104 | 16.066 |
| 1.411999999999784 | 5.795 | 8.183 | 16.314 |
| 1.415999999999784 | 5.835 | 8.262 | 16.566 |
| 1.419999999999784 | 5.875 | 8.342 | 16.821 |
| 1.423999999999784 | 5.915 | 8.423 | 17.08 |
| 1.427999999999784 | 5.955 | 8.504 | 17.341 |
| 1.431999999999784 | 5.996 | 8.586 | 17.607 |
| 1.435999999999784 | 6.037 | 8.669 | 17.876 |
| 1.439999999999784 | 6.078 | 8.752 | 18.148 |
| 1.443999999999784 | 6.119 | 8.836 | 18.424 |
| 1.447999999999784 | 6.161 | 8.921 | 18.704 |
| 1.451999999999784 | 6.202 | 9.006 | 18.987 |
| 1.455999999999784 | 6.244 | 9.092 | 19.274 |
| 1.459999999999784 | 6.287 | 9.179 | 19.565 |
| 1.463999999999784 | 6.329 | 9.266 | 19.86 |
| 1.467999999999784 | 6.372 | 9.354 | 20.158 |
| 1.471999999999784 | 6.415 | 9.443 | 20.46 |
| 1.475999999999784 | 6.458 | 9.532 | 20.767 |
| 1.479999999999784 | 6.502 | 9.622 | 21.077 |
| 1.483999999999784 | 6.545 | 9.713 | 21.391 |
| 1.487999999999784 | 6.589 | 9.805 | 21.709 |
| 1.491999999999784 | 6.633 | 9.897 | 22.031 |
| 1.495999999999784 | 6.678 | 9.99 | 22.358 |
| 1.499999999999784 | 6.723 | 10.084 | 22.689 |
| 1.503999999999784 | 6.767 | 10.178 | 23.023 |
| 1.507999999999784 | 6.813 | 10.274 | 23.363 |
| 1.511999999999784 | 6.858 | 10.369 | 23.706 |
| 1.515999999999784 | 6.904 | 10.466 | 24.054 |
| 1.519999999999784 | 6.95 | 10.564 | 24.406 |
| 1.523999999999784 | 6.996 | 10.662 | 24.763 |
| 1.527999999999784 | 7.042 | 10.761 | 25.124 |
| 1.531999999999784 | 7.089 | 10.861 | 25.49 |
| 1.535999999999784 | 7.136 | 10.961 | 25.861 |
| 1.539999999999784 | 7.183 | 11.063 | 26.236 |
| 1.543999999999784 | 7.231 | 11.165 | 26.616 |
| 1.547999999999784 | 7.279 | 11.268 | 27 |
| 1.551999999999784 | 7.327 | 11.371 | 27.39 |
| 1.555999999999784 | 7.375 | 11.476 | 27.784 |
| 1.559999999999784 | 7.424 | 11.581 | 28.184 |
| 1.563999999999784 | 7.473 | 11.687 | 28.588 |
| 1.567999999999784 | 7.522 | 11.794 | 28.997 |
| 1.571999999999784 | 7.571 | 11.902 | 29.412 |
| 1.575999999999784 | 7.621 | 12.01 | 29.831 |
| 1.579999999999784 | 7.671 | 12.12 | 30.256 |
| 1.583999999999784 | 7.721 | 12.23 | 30.686 |
| 1.587999999999784 | 7.772 | 12.341 | 31.122 |
| 1.591999999999784 | 7.822 | 12.453 | 31.562 |
| 1.595999999999784 | 7.873 | 12.566 | 32.009 |
| 1.599999999999784 | 7.925 | 12.68 | 32.46 |
| 1.603999999999784 | 7.977 | 12.794 | 32.917 |
| 1.607999999999784 | 8.028 | 12.91 | 33.38 |
| 1.611999999999784 | 8.081 | 13.026 | 33.849 |
| 1.615999999999784 | 8.133 | 13.143 | 34.323 |
| 1.619999999999784 | 8.186 | 13.261 | 34.803 |
| 1.623999999999784 | 8.239 | 13.38 | 35.289 |
| 1.627999999999784 | 8.293 | 13.5 | 35.781 |
| 1.631999999999784 | 8.346 | 13.621 | 36.278 |
| 1.635999999999784 | 8.4 | 13.743 | 36.782 |
| 1.639999999999784 | 8.454 | 13.865 | 37.292 |
| 1.643999999999784 | 8.509 | 13.989 | 37.808 |
| 1.647999999999784 | 8.564 | 14.113 | 38.331 |
| 1.651999999999784 | 8.619 | 14.239 | 38.859 |
| 1.655999999999784 | 8.675 | 14.365 | 39.394 |
| 1.659999999999784 | 8.73 | 14.493 | 39.936 |
| 1.663999999999784 | 8.787 | 14.621 | 40.484 |
| 1.667999999999784 | 8.843 | 14.75 | 41.038 |
| 1.671999999999784 | 8.9 | 14.88 | 41.599 |
| 1.675999999999784 | 8.957 | 15.012 | 42.167 |
| 1.679999999999784 | 9.014 | 15.144 | 42.742 |
| 1.683999999999784 | 9.072 | 15.277 | 43.323 |
| 1.687999999999784 | 9.13 | 15.411 | 43.912 |
| 1.691999999999784 | 9.188 | 15.546 | 44.507 |
| 1.695999999999784 | 9.247 | 15.682 | 45.109 |
| 1.699999999999784 | 9.306 | 15.82 | 45.719 |
| 1.703999999999785 | 9.365 | 15.958 | 46.336 |
| 1.707999999999785 | 9.425 | 16.097 | 46.96 |
| 1.711999999999785 | 9.485 | 16.238 | 47.591 |
| 1.715999999999785 | 9.545 | 16.379 | 48.23 |
| 1.719999999999785 | 9.605 | 16.521 | 48.877 |
| 1.723999999999785 | 9.666 | 16.665 | 49.531 |
| 1.727999999999785 | 9.728 | 16.809 | 50.192 |
| 1.731999999999785 | 9.789 | 16.955 | 50.862 |
| 1.735999999999785 | 9.851 | 17.102 | 51.539 |
| 1.739999999999785 | 9.913 | 17.249 | 52.224 |
| 1.743999999999785 | 9.976 | 17.398 | 52.917 |
| 1.747999999999785 | 10.039 | 17.548 | 53.618 |
| 1.751999999999785 | 10.102 | 17.699 | 54.328 |
| 1.755999999999785 | 10.166 | 17.851 | 55.045 |
| 1.759999999999785 | 10.23 | 18.005 | 55.771 |
| 1.763999999999785 | 10.294 | 18.159 | 56.505 |
| 1.767999999999785 | 10.359 | 18.315 | 57.248 |
| 1.771999999999785 | 10.424 | 18.471 | 58 |
| 1.775999999999785 | 10.489 | 18.629 | 58.76 |
| 1.779999999999785 | 10.555 | 18.788 | 59.528 |
| 1.783999999999785 | 10.621 | 18.948 | 60.306 |
| 1.787999999999785 | 10.688 | 19.11 | 61.093 |
| 1.791999999999785 | 10.755 | 19.272 | 61.888 |
| 1.795999999999785 | 10.822 | 19.436 | 62.693 |
| 1.799999999999785 | 10.889 | 19.601 | 63.507 |
| 1.803999999999785 | 10.957 | 19.767 | 64.33 |
| 1.807999999999785 | 11.026 | 19.934 | 65.163 |
| 1.811999999999785 | 11.094 | 20.103 | 66.005 |
| 1.815999999999785 | 11.163 | 20.273 | 66.856 |
| 1.819999999999785 | 11.233 | 20.444 | 67.718 |
| 1.823999999999785 | 11.303 | 20.616 | 68.589 |
| 1.827999999999785 | 11.373 | 20.789 | 69.47 |
| 1.831999999999785 | 11.443 | 20.964 | 70.361 |
| 1.835999999999785 | 11.514 | 21.14 | 71.262 |
| 1.839999999999785 | 11.586 | 21.318 | 72.173 |
| 1.843999999999785 | 11.657 | 21.496 | 73.094 |
| 1.847999999999785 | 11.729 | 21.676 | 74.026 |
| 1.851999999999785 | 11.802 | 21.857 | 74.968 |
| 1.855999999999785 | 11.875 | 22.04 | 75.921 |
| 1.859999999999785 | 11.948 | 22.224 | 76.885 |
| 1.863999999999785 | 12.022 | 22.409 | 77.859 |
| 1.867999999999785 | 12.096 | 22.595 | 78.844 |
| 1.871999999999785 | 12.17 | 22.783 | 79.84 |
| 1.875999999999785 | 12.245 | 22.972 | 80.848 |
| 1.879999999999785 | 12.321 | 23.163 | 81.866 |
| 1.883999999999785 | 12.396 | 23.355 | 82.896 |
| 1.887999999999785 | 12.472 | 23.548 | 83.937 |
| 1.891999999999785 | 12.549 | 23.743 | 84.99 |
| 1.895999999999785 | 12.626 | 23.939 | 86.055 |
| 1.899999999999785 | 12.703 | 24.136 | 87.131 |
| 1.903999999999785 | 12.781 | 24.335 | 88.219 |
| 1.907999999999785 | 12.859 | 24.535 | 89.32 |
| 1.911999999999785 | 12.938 | 24.737 | 90.432 |
| 1.915999999999785 | 13.017 | 24.94 | 91.557 |
| 1.919999999999785 | 13.096 | 25.145 | 92.694 |
| 1.923999999999785 | 13.176 | 25.351 | 93.843 |
| 1.927999999999785 | 13.256 | 25.558 | 95.005 |
| 1.931999999999785 | 13.337 | 25.767 | 96.18 |
| 1.935999999999785 | 13.418 | 25.978 | 97.368 |
| 1.939999999999785 | 13.5 | 26.19 | 98.569 |
| 1.943999999999785 | 13.582 | 26.403 | 99.782 |
| 1.947999999999785 | 13.665 | 26.618 | 101.009 |
| 1.951999999999785 | 13.747 | 26.835 | 102.25 |
| 1.955999999999785 | 13.831 | 27.053 | 103.504 |
| 1.959999999999785 | 13.915 | 27.273 | 104.771 |
| 1.963999999999785 | 13.999 | 27.494 | 106.052 |
| 1.967999999999785 | 14.084 | 27.717 | 107.347 |
| 1.971999999999785 | 14.169 | 27.941 | 108.657 |
| 1.975999999999785 | 14.255 | 28.167 | 109.98 |
| 1.979999999999785 | 14.341 | 28.394 | 111.318 |
| 1.983999999999785 | 14.427 | 28.624 | 112.67 |
| 1.987999999999785 | 14.514 | 28.854 | 114.036 |
| 1.991999999999785 | 14.602 | 29.087 | 115.418 |
| 1.995999999999785 | 14.69 | 29.321 | 116.814 |
| 1.999999999999785 | 14.778 | 29.556 | 118.225 |